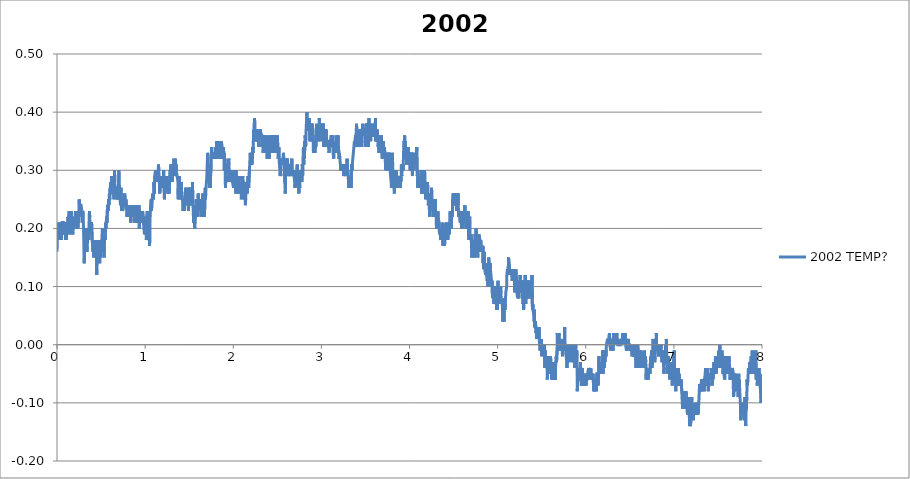
| Category | 2002 TEMP? |
|---|---|
| 0.0009014404444444445 | 0.16 |
| 0.003960782083333334 | 0.19 |
| 0.007023179472222222 | 0.19 |
| 0.010082798916666667 | 0.19 |
| 0.013142973944444445 | 0.19 |
| 0.01620231561111111 | 0.21 |
| 0.019261657249999998 | 0.2 |
| 0.0223215545 | 0.18 |
| 0.02538089613888889 | 0.19 |
| 0.028439959999999997 | 0.18 |
| 0.03149930166666667 | 0.19 |
| 0.034559754472222225 | 0.2 |
| 0.037619373916666664 | 0.21 |
| 0.04067871558333333 | 0.18 |
| 0.043738057222222224 | 0.2 |
| 0.04679739888888889 | 0.21 |
| 0.04985701833333333 | 0.18 |
| 0.05291635997222222 | 0.19 |
| 0.05597597941666666 | 0.2 |
| 0.059035598861111115 | 0.21 |
| 0.06209466272222222 | 0.21 |
| 0.06515567113888888 | 0.21 |
| 0.06821584616666666 | 0.21 |
| 0.07127518780555556 | 0.21 |
| 0.07433480725 | 0.19 |
| 0.07739414891666667 | 0.19 |
| 0.08045321277777778 | 0.21 |
| 0.08351311 | 0.19 |
| 0.0865721738611111 | 0.19 |
| 0.08963151552777779 | 0.21 |
| 0.09269085716666665 | 0.2 |
| 0.09575158777777777 | 0.2 |
| 0.09881092944444443 | 0.18 |
| 0.10187082666666668 | 0.2 |
| 0.10492989052777778 | 0.18 |
| 0.10798923219444444 | 0.19 |
| 0.11104829602777777 | 0.2 |
| 0.11410763769444444 | 0.19 |
| 0.11716697933333332 | 0.2 |
| 0.12022604319444445 | 0.21 |
| 0.12328566263888889 | 0.2 |
| 0.12634500430555556 | 0.22 |
| 0.12940406816666666 | 0.21 |
| 0.132463132 | 0.22 |
| 0.13552330705555557 | 0.22 |
| 0.1385829265 | 0.23 |
| 0.1416422681388889 | 0.19 |
| 0.14470188758333333 | 0.21 |
| 0.14776122922222223 | 0.23 |
| 0.1508205708888889 | 0.22 |
| 0.15388019033333333 | 0.23 |
| 0.15693925419444443 | 0.2 |
| 0.15999859583333334 | 0.23 |
| 0.1630579375 | 0.23 |
| 0.16611700133333332 | 0.2 |
| 0.169176343 | 0.19 |
| 0.1722356846388889 | 0.21 |
| 0.17529530408333333 | 0.21 |
| 0.17835520133333335 | 0.19 |
| 0.18141454297222223 | 0.2 |
| 0.18447360683333333 | 0.21 |
| 0.1875368376111111 | 0.2 |
| 0.1905967348333333 | 0.2 |
| 0.19365718766666667 | 0.2 |
| 0.1967176405 | 0.22 |
| 0.1997792045 | 0.22 |
| 0.20284049069444443 | 0.2 |
| 0.2059014991111111 | 0.22 |
| 0.20896084075000002 | 0.23 |
| 0.21202101580555555 | 0.23 |
| 0.21508202419444444 | 0.2 |
| 0.21814247702777778 | 0.22 |
| 0.22120209647222222 | 0.21 |
| 0.22426393827777777 | 0.22 |
| 0.2273235577222222 | 0.23 |
| 0.23038428833333333 | 0.2 |
| 0.2334444633611111 | 0.22 |
| 0.23650630516666665 | 0.2 |
| 0.2395675913611111 | 0.22 |
| 0.24262915536111113 | 0.23 |
| 0.24568877480555557 | 0.21 |
| 0.24874811647222222 | 0.23 |
| 0.2518074581111111 | 0.25 |
| 0.25486791094444444 | 0.24 |
| 0.2579280859722222 | 0.22 |
| 0.2609913167222222 | 0.24 |
| 0.2640520473611111 | 0.24 |
| 0.26711722266666665 | 0.24 |
| 0.2701776755 | 0.24 |
| 0.2732603518055556 | 0.24 |
| 0.2763194156666667 | 0.24 |
| 0.2793798685 | 0.24 |
| 0.2824392101388889 | 0.23 |
| 0.28549882958333334 | 0.22 |
| 0.28855817125 | 0.21 |
| 0.29161751288888893 | 0.23 |
| 0.29467685455555553 | 0.23 |
| 0.29773619619444447 | 0.22 |
| 0.30079553786111113 | 0.22 |
| 0.30385515730555557 | 0.18 |
| 0.30691449894444445 | 0.15 |
| 0.3099752295555555 | 0.14 |
| 0.313034849 | 0.18 |
| 0.31609419066666666 | 0.18 |
| 0.31915325452777776 | 0.18 |
| 0.32221315175 | 0.2 |
| 0.32527582694444446 | 0.18 |
| 0.3283354463888889 | 0.17 |
| 0.3313945102222222 | 0.19 |
| 0.3344538518888889 | 0.17 |
| 0.33751486030555555 | 0.17 |
| 0.34057447975000005 | 0.16 |
| 0.34363382138888887 | 0.17 |
| 0.3466942742222222 | 0.18 |
| 0.3497558382222222 | 0.2 |
| 0.3528149020833333 | 0.19 |
| 0.3558742437222222 | 0.19 |
| 0.3589335853888889 | 0.18 |
| 0.3619934826111111 | 0.2 |
| 0.3650531020555556 | 0.2 |
| 0.3681121659166666 | 0.23 |
| 0.3711720631666667 | 0.22 |
| 0.37423612730555555 | 0.21 |
| 0.37729519116666665 | 0.21 |
| 0.38035508838888893 | 0.21 |
| 0.3834147078333333 | 0.19 |
| 0.38647488286111115 | 0.21 |
| 0.38953478011111115 | 0.19 |
| 0.39259439955555553 | 0.21 |
| 0.39565374119444446 | 0.21 |
| 0.3987130828611111 | 0.18 |
| 0.4017721467222222 | 0.18 |
| 0.4048314883611111 | 0.17 |
| 0.40789110780555554 | 0.16 |
| 0.4109504494722222 | 0.18 |
| 0.4140103466944445 | 0.17 |
| 0.4170694105555555 | 0.15 |
| 0.42012875222222223 | 0.16 |
| 0.4231883716666667 | 0.17 |
| 0.42624771330555555 | 0.16 |
| 0.4293081661388889 | 0.17 |
| 0.43236778558333333 | 0.16 |
| 0.43542740502777777 | 0.17 |
| 0.43848730225 | 0.18 |
| 0.4415466439166667 | 0.17 |
| 0.4446059855555556 | 0.16 |
| 0.44766532722222224 | 0.15 |
| 0.4507246688611111 | 0.12 |
| 0.4537840105 | 0.15 |
| 0.4568433521666667 | 0.15 |
| 0.45990324941666666 | 0.16 |
| 0.46296231325000003 | 0.16 |
| 0.46602304388888893 | 0.17 |
| 0.46908544124999996 | 0.18 |
| 0.47214506069444445 | 0.17 |
| 0.4752069025 | 0.17 |
| 0.47826652194444447 | 0.16 |
| 0.48132641919444447 | 0.16 |
| 0.48438576083333335 | 0.14 |
| 0.4874503805555555 | 0.16 |
| 0.4905097222222222 | 0.18 |
| 0.49357323077777776 | 0.15 |
| 0.49663423919444444 | 0.17 |
| 0.4996944142222222 | 0.17 |
| 0.5027543114444445 | 0.16 |
| 0.5058358766111111 | 0.17 |
| 0.50889994075 | 0.17 |
| 0.5119620603333334 | 0.17 |
| 0.5150222353611111 | 0.2 |
| 0.518081577 | 0.19 |
| 0.5211445299722222 | 0.18 |
| 0.5242149833888889 | 0.19 |
| 0.5272784919444444 | 0.19 |
| 0.5303408893055556 | 0.17 |
| 0.53340050875 | 0.15 |
| 0.5364606838055556 | 0.17 |
| 0.5395200254444444 | 0.17 |
| 0.5425793670833333 | 0.19 |
| 0.5456384309444444 | 0.18 |
| 0.5486983281944444 | 0.19 |
| 0.5517590588055555 | 0.21 |
| 0.5548203450277778 | 0.2 |
| 0.5578799644722222 | 0.21 |
| 0.5609398616944444 | 0.21 |
| 0.56400337025 | 0.22 |
| 0.5670652120555556 | 0.21 |
| 0.5701248315 | 0.23 |
| 0.5731861176944445 | 0.23 |
| 0.5762535153611111 | 0.24 |
| 0.579318412888889 | 0.23 |
| 0.5823780323333334 | 0.23 |
| 0.5854382073611112 | 0.25 |
| 0.5884981046111111 | 0.24 |
| 0.5915630021388889 | 0.25 |
| 0.5946242883333334 | 0.26 |
| 0.5976839077777778 | 0.25 |
| 0.6007438050277777 | 0.25 |
| 0.6038053690277777 | 0.27 |
| 0.6068669330277777 | 0.26 |
| 0.6099287748055556 | 0.28 |
| 0.6129889498611111 | 0.28 |
| 0.6160510694444444 | 0.27 |
| 0.6191159669722222 | 0.29 |
| 0.6221755864166667 | 0.29 |
| 0.62523465025 | 0.28 |
| 0.6282978810277777 | 0.29 |
| 0.6313580560555556 | 0.29 |
| 0.6344176755 | 0.29 |
| 0.6374772949444445 | 0.28 |
| 0.6405388589444444 | 0.29 |
| 0.6435987561944445 | 0.26 |
| 0.6466630981111111 | 0.25 |
| 0.6497257733055556 | 0.27 |
| 0.652786226111111 | 0.3 |
| 0.6558483457222222 | 0.28 |
| 0.6589090763333334 | 0.27 |
| 0.6619686957777777 | 0.27 |
| 0.6650305375555556 | 0.27 |
| 0.6680926571666667 | 0.27 |
| 0.671153943361111 | 0.27 |
| 0.6742143961944443 | 0.26 |
| 0.6772748490277777 | 0.26 |
| 0.6803408577222222 | 0.27 |
| 0.6834035328888889 | 0.25 |
| 0.6864650968888889 | 0.27 |
| 0.6895272164722223 | 0.26 |
| 0.6925868359166667 | 0.25 |
| 0.69564728875 | 0.25 |
| 0.698708019361111 | 0.28 |
| 0.7017695833611111 | 0.3 |
| 0.7048294806111112 | 0.28 |
| 0.70788882225 | 0.28 |
| 0.7109506640555556 | 0.27 |
| 0.7140100056944444 | 0.27 |
| 0.7170693473611112 | 0.27 |
| 0.7201292445833334 | 0.24 |
| 0.7231891418333333 | 0.26 |
| 0.7262487612777777 | 0.27 |
| 0.7293081029166667 | 0.25 |
| 0.7323674445833334 | 0.23 |
| 0.735427619611111 | 0.24 |
| 0.7384872390555556 | 0.24 |
| 0.7415490808333334 | 0.25 |
| 0.7446092558888889 | 0.23 |
| 0.7476683197222223 | 0.23 |
| 0.7507276613888889 | 0.23 |
| 0.7537872808333334 | 0.24 |
| 0.7568477336666667 | 0.24 |
| 0.7599104088333334 | 0.25 |
| 0.7629725284166666 | 0.25 |
| 0.7660352035833333 | 0.25 |
| 0.7690948230277778 | 0.26 |
| 0.7721549980833333 | 0.25 |
| 0.77521767325 | 0.24 |
| 0.778278403861111 | 0.24 |
| 0.7813383011111111 | 0.25 |
| 0.7843979205555556 | 0.25 |
| 0.7874619846944444 | 0.24 |
| 0.7905229931111112 | 0.24 |
| 0.79358233475 | 0.22 |
| 0.796642232 | 0.22 |
| 0.7997015736388889 | 0.23 |
| 0.80276230425 | 0.23 |
| 0.8058224793055556 | 0.23 |
| 0.8088851544722223 | 0.24 |
| 0.8119500519999999 | 0.23 |
| 0.8150093936388888 | 0.23 |
| 0.8180726244166667 | 0.23 |
| 0.8211352995833334 | 0.23 |
| 0.8241960301944444 | 0.23 |
| 0.8272562052222222 | 0.22 |
| 0.8303169358611111 | 0.22 |
| 0.8333787776388889 | 0.23 |
| 0.8364389526666667 | 0.21 |
| 0.8395002388888889 | 0.24 |
| 0.8425623584722222 | 0.22 |
| 0.845629478361111 | 0.22 |
| 0.8486899311666667 | 0.22 |
| 0.8517506618055556 | 0.23 |
| 0.8548116701944445 | 0.23 |
| 0.8578721230277777 | 0.24 |
| 0.8609361871666668 | 0.22 |
| 0.8639971955833333 | 0.24 |
| 0.8670573706111111 | 0.22 |
| 0.8701172678611111 | 0.22 |
| 0.8731793874444445 | 0.23 |
| 0.8762426182222223 | 0.23 |
| 0.8793025154444445 | 0.21 |
| 0.8823621348888889 | 0.24 |
| 0.8854234211111112 | 0.23 |
| 0.8884847073055555 | 0.24 |
| 0.8915448823333333 | 0.23 |
| 0.8946086686944444 | 0.23 |
| 0.8976716216666667 | 0.22 |
| 0.9007323522777777 | 0.23 |
| 0.903792805111111 | 0.24 |
| 0.9068554802777777 | 0.23 |
| 0.9099159331111111 | 0.21 |
| 0.9129813862222221 | 0.21 |
| 0.9160410056666667 | 0.22 |
| 0.9191053475833333 | 0.21 |
| 0.9221644114444444 | 0.22 |
| 0.9252254198611112 | 0.21 |
| 0.9282875394444444 | 0.22 |
| 0.9313468811111111 | 0.24 |
| 0.93440622275 | 0.2 |
| 0.9374661200000001 | 0.2 |
| 0.9405329620833334 | 0.22 |
| 0.9435923037222222 | 0.21 |
| 0.9466519231666666 | 0.22 |
| 0.9497129315833334 | 0.21 |
| 0.9527725510277778 | 0.22 |
| 0.9558330038611111 | 0.21 |
| 0.9588931788888889 | 0.22 |
| 0.9619536317222223 | 0.21 |
| 0.9650154734999999 | 0.23 |
| 0.9680750929444445 | 0.21 |
| 0.971134434611111 | 0.23 |
| 0.9741976653611111 | 0.23 |
| 0.9772586737777778 | 0.22 |
| 0.9803205155555555 | 0.21 |
| 0.9833823573611111 | 0.21 |
| 0.9864422546111111 | 0.2 |
| 0.989503818611111 | 0.2 |
| 0.9925651048055555 | 0.19 |
| 0.9956258354166666 | 0.19 |
| 0.9986851770833333 | 0.19 |
| 1.0017445187222223 | 0.22 |
| 1.0048041381666666 | 0.22 |
| 1.0078690356944444 | 0.2 |
| 1.0109311552777778 | 0.19 |
| 1.013991608111111 | 0.18 |
| 1.0170551166666666 | 0.18 |
| 1.0201155695 | 0.19 |
| 1.0231749111388888 | 0.23 |
| 1.0262353639722221 | 0.2 |
| 1.0292988725277779 | 0.21 |
| 1.0323601587222222 | 0.21 |
| 1.0354211671388889 | 0.21 |
| 1.038480231 | 0.21 |
| 1.0415395726666667 | 0.22 |
| 1.0446022478333334 | 0.2 |
| 1.0476668675555556 | 0.19 |
| 1.0507292649444444 | 0.17 |
| 1.0537894399722223 | 0.21 |
| 1.0568543375000001 | 0.21 |
| 1.0599150681111111 | 0.23 |
| 1.062986354888889 | 0.24 |
| 1.066047918888889 | 0.24 |
| 1.0691089273055554 | 0.25 |
| 1.07216854675 | 0.23 |
| 1.07523011075 | 0.23 |
| 1.0782894524166666 | 0.25 |
| 1.0813526831666667 | 0.25 |
| 1.0844161917222221 | 0.25 |
| 1.08747636675 | 0.26 |
| 1.090536264 | 0.26 |
| 1.093597828 | 0.25 |
| 1.0966588364166667 | 0.26 |
| 1.0997215115833332 | 0.28 |
| 1.1027819644166665 | 0.28 |
| 1.1058454729722222 | 0.26 |
| 1.1089062035833332 | 0.29 |
| 1.111968045388889 | 0.29 |
| 1.1150346096666668 | 0.29 |
| 1.1180945068888888 | 0.3 |
| 1.12115357075 | 0.3 |
| 1.1242181905 | 0.29 |
| 1.127277532138889 | 0.29 |
| 1.1303385405555555 | 0.28 |
| 1.1334020491111112 | 0.29 |
| 1.13646139075 | 0.29 |
| 1.1395285106388888 | 0.29 |
| 1.1425897968333334 | 0.29 |
| 1.1456519164166667 | 0.29 |
| 1.148711535861111 | 0.3 |
| 1.1517733776666668 | 0.31 |
| 1.1548354972500001 | 0.3 |
| 1.1578948389166668 | 0.29 |
| 1.160954458361111 | 0.29 |
| 1.1640140778055554 | 0.27 |
| 1.1670767529722221 | 0.26 |
| 1.1701363724166665 | 0.29 |
| 1.1731987698055557 | 0.29 |
| 1.1762589448333334 | 0.28 |
| 1.1793213422222222 | 0.29 |
| 1.1823812394444444 | 0.27 |
| 1.1854436368333334 | 0.27 |
| 1.1885040896666668 | 0.27 |
| 1.1915650980555557 | 0.27 |
| 1.1946291622222223 | 0.29 |
| 1.197691004 | 0.28 |
| 1.2007536791666666 | 0.27 |
| 1.2038191322777778 | 0.29 |
| 1.2068795851111112 | 0.28 |
| 1.2099419825 | 0.3 |
| 1.2130027131111112 | 0.27 |
| 1.2160642771111112 | 0.27 |
| 1.2191252855277779 | 0.25 |
| 1.2221901830555557 | 0.27 |
| 1.2252498025 | 0.27 |
| 1.2283138666388889 | 0.28 |
| 1.2313765418055556 | 0.28 |
| 1.2344406059722224 | 0.29 |
| 1.2375168930277778 | 0.27 |
| 1.240577623638889 | 0.28 |
| 1.2436372430833333 | 0.28 |
| 1.2466979737222221 | 0.29 |
| 1.2497628712222222 | 0.28 |
| 1.2528236018611112 | 0.27 |
| 1.2559004445 | 0.28 |
| 1.2589622863055554 | 0.26 |
| 1.2620213501666666 | 0.26 |
| 1.265085969888889 | 0.26 |
| 1.2681458671388888 | 0.28 |
| 1.271207431138889 | 0.26 |
| 1.2742951077222222 | 0.27 |
| 1.2773569495277777 | 0.28 |
| 1.28041684675 | 0.28 |
| 1.283477577388889 | 0.3 |
| 1.2865380301944445 | 0.3 |
| 1.2895995942222223 | 0.28 |
| 1.292662824972222 | 0.31 |
| 1.2957221666111112 | 0.28 |
| 1.2987826194444445 | 0.28 |
| 1.3018480725555555 | 0.3 |
| 1.304907692 | 0.3 |
| 1.3079703671666667 | 0.28 |
| 1.3110294310277777 | 0.3 |
| 1.3140896060555556 | 0.3 |
| 1.3171525590277777 | 0.3 |
| 1.3202119006944446 | 0.29 |
| 1.3232717979166666 | 0.31 |
| 1.32633225075 | 0.32 |
| 1.3293927035833333 | 0.32 |
| 1.3324534341944445 | 0.3 |
| 1.3355133314444445 | 0.29 |
| 1.3385751732222222 | 0.29 |
| 1.3416347926666667 | 0.3 |
| 1.3446955233055558 | 0.32 |
| 1.3477779218055554 | 0.3 |
| 1.3508389302222223 | 0.31 |
| 1.3539027165833333 | 0.3 |
| 1.356967891888889 | 0.3 |
| 1.3600344561944444 | 0.3 |
| 1.3630943534166666 | 0.29 |
| 1.3661567508055554 | 0.29 |
| 1.3692172036388888 | 0.29 |
| 1.372277100861111 | 0.28 |
| 1.3753433873611112 | 0.25 |
| 1.3784038401944445 | 0.28 |
| 1.38146734875 | 0.27 |
| 1.3845283571666667 | 0.28 |
| 1.3875882543888889 | 0.29 |
| 1.3906481516388887 | 0.27 |
| 1.3937077710833334 | 0.28 |
| 1.3967710018333332 | 0.25 |
| 1.3998325658333333 | 0.25 |
| 1.4028927408611112 | 0.25 |
| 1.405954304861111 | 0.27 |
| 1.4090161466666666 | 0.28 |
| 1.4120765995 | 0.28 |
| 1.4151448305277778 | 0.26 |
| 1.4182041721944445 | 0.26 |
| 1.42127240325 | 0.26 |
| 1.4243361895833333 | 0.25 |
| 1.4273988647777778 | 0.24 |
| 1.4304607065555555 | 0.23 |
| 1.4335419939166667 | 0.24 |
| 1.436603280111111 | 0.25 |
| 1.4396681776388889 | 0.25 |
| 1.442727519277778 | 0.24 |
| 1.4457876943333334 | 0.23 |
| 1.4488484249444447 | 0.25 |
| 1.4519102667500001 | 0.25 |
| 1.4549712751388888 | 0.26 |
| 1.4580356170833335 | 0.26 |
| 1.4610980144722223 | 0.27 |
| 1.4641587450833335 | 0.24 |
| 1.4672205868888888 | 0.24 |
| 1.4702821508888888 | 0.26 |
| 1.4733417703333334 | 0.27 |
| 1.4764033343333334 | 0.26 |
| 1.479462953777778 | 0.25 |
| 1.4825234065833333 | 0.26 |
| 1.485584970611111 | 0.25 |
| 1.4886551461944444 | 0.24 |
| 1.491714765638889 | 0.23 |
| 1.494774662888889 | 0.25 |
| 1.4978348379166666 | 0.25 |
| 1.5008950129444445 | 0.24 |
| 1.5039549101944443 | 0.27 |
| 1.5070253635833335 | 0.25 |
| 1.5101135957777778 | 0.27 |
| 1.5131734930277778 | 0.26 |
| 1.5162328346666667 | 0.24 |
| 1.5192921763055556 | 0.25 |
| 1.5223548515 | 0.25 |
| 1.5254158599166665 | 0.24 |
| 1.5284779795 | 0.26 |
| 1.5315375989444444 | 0.25 |
| 1.5345972183888887 | 0.26 |
| 1.5376612825277778 | 0.28 |
| 1.5407220131388888 | 0.25 |
| 1.5437852439166666 | 0.24 |
| 1.5468451411388888 | 0.24 |
| 1.549905038388889 | 0.21 |
| 1.5529652134166667 | 0.22 |
| 1.5560270552222222 | 0.24 |
| 1.5590861190555556 | 0.22 |
| 1.5621460163055556 | 0.2 |
| 1.5652061913333333 | 0.2 |
| 1.5682691443055556 | 0.22 |
| 1.571330986111111 | 0.23 |
| 1.5743953280277778 | 0.24 |
| 1.5774546696944445 | 0.22 |
| 1.5805176226666668 | 0.25 |
| 1.5835786310833333 | 0.23 |
| 1.58664130625 | 0.24 |
| 1.5897014812777777 | 0.24 |
| 1.592761934111111 | 0.23 |
| 1.5958271094166667 | 0.22 |
| 1.5988897845833334 | 0.24 |
| 1.6019502374166668 | 0.26 |
| 1.6050126348055556 | 0.25 |
| 1.6080775323333334 | 0.25 |
| 1.6111452077777777 | 0.24 |
| 1.6142062161944444 | 0.24 |
| 1.6172655578611113 | 0.23 |
| 1.6203268440555556 | 0.23 |
| 1.6233867413055554 | 0.25 |
| 1.6264460829444445 | 0.25 |
| 1.6295065357777778 | 0.25 |
| 1.6325661552222221 | 0.23 |
| 1.6356304971666666 | 0.22 |
| 1.6386928945277777 | 0.22 |
| 1.6417594588333335 | 0.25 |
| 1.6448243563333333 | 0.23 |
| 1.6478839758055557 | 0.24 |
| 1.6509441508333333 | 0.24 |
| 1.6540037702777777 | 0.26 |
| 1.657065889861111 | 0.23 |
| 1.660135509861111 | 0.22 |
| 1.6631951293055556 | 0.23 |
| 1.6662608602222222 | 0.24 |
| 1.6693207574722222 | 0.22 |
| 1.6723814880833334 | 0.22 |
| 1.6754458300277777 | 0.22 |
| 1.67851044975 | 0.24 |
| 1.6815697913888887 | 0.27 |
| 1.6846302442222223 | 0.25 |
| 1.687689585888889 | 0.26 |
| 1.6907672619166667 | 0.26 |
| 1.6938313260555555 | 0.26 |
| 1.6968909455 | 0.26 |
| 1.699950009361111 | 0.29 |
| 1.7030107399722223 | 0.3 |
| 1.706070637222222 | 0.3 |
| 1.7091327568055554 | 0.33 |
| 1.7121926540277779 | 0.33 |
| 1.7152592183333333 | 0.32 |
| 1.7183199489444445 | 0.3 |
| 1.7213815129444445 | 0.31 |
| 1.7244430769444443 | 0.3 |
| 1.7275024185833334 | 0.29 |
| 1.7305617602499999 | 0.29 |
| 1.7336213796944444 | 0.27 |
| 1.7366859994166668 | 0.29 |
| 1.7397456188611111 | 0.27 |
| 1.7428063494722221 | 0.29 |
| 1.7458659689166667 | 0.29 |
| 1.7489272551388888 | 0.3 |
| 1.75198798575 | 0.33 |
| 1.755047883 | 0.34 |
| 1.7581091691944446 | 0.34 |
| 1.761168510861111 | 0.32 |
| 1.7642289636666666 | 0.32 |
| 1.7672888609166666 | 0.32 |
| 1.7703543140277778 | 0.33 |
| 1.7734136556666666 | 0.33 |
| 1.7764741085 | 0.32 |
| 1.7795367836666667 | 0.32 |
| 1.7825966809166667 | 0.32 |
| 1.7856621340277776 | 0.33 |
| 1.788732309638889 | 0.33 |
| 1.7917941514166666 | 0.32 |
| 1.7948587711666666 | 0.32 |
| 1.797921724138889 | 0.33 |
| 1.8009835659166666 | 0.34 |
| 1.804043185361111 | 0.32 |
| 1.8071036381944443 | 0.34 |
| 1.810167980138889 | 0.33 |
| 1.8132281551666667 | 0.35 |
| 1.8162922193055555 | 0.34 |
| 1.8193518387499998 | 0.34 |
| 1.8224142361388889 | 0.34 |
| 1.8254744111666665 | 0.32 |
| 1.8285354195833332 | 0.35 |
| 1.831596428 | 0.34 |
| 1.8346591031666668 | 0.35 |
| 1.8377203893611112 | 0.32 |
| 1.8407825089444443 | 0.33 |
| 1.843842128388889 | 0.32 |
| 1.8469100816666666 | 0.32 |
| 1.8499697011111111 | 0.32 |
| 1.8530320984722224 | 0.33 |
| 1.8560922735277778 | 0.34 |
| 1.85915217075 | 0.33 |
| 1.8622123457777777 | 0.33 |
| 1.8652747431666665 | 0.35 |
| 1.868336029361111 | 0.35 |
| 1.8714037048333332 | 0.34 |
| 1.87446471325 | 0.34 |
| 1.8775243326944444 | 0.32 |
| 1.8805842299166668 | 0.33 |
| 1.8836444049722223 | 0.32 |
| 1.886703746611111 | 0.33 |
| 1.8897650328055555 | 0.34 |
| 1.8928393753333332 | 0.32 |
| 1.8959012171111111 | 0.33 |
| 1.8989611143611111 | 0.3 |
| 1.9020224005555555 | 0.31 |
| 1.9050831311944443 | 0.32 |
| 1.9081455285555555 | 0.3 |
| 1.9112098704999998 | 0.27 |
| 1.914268934361111 | 0.27 |
| 1.9173382765833333 | 0.29 |
| 1.9203976182222222 | 0.28 |
| 1.9234569598888889 | 0.31 |
| 1.9265168571388889 | 0.3 |
| 1.9295770321666665 | 0.31 |
| 1.93263915175 | 0.3 |
| 1.9357034936944446 | 0.31 |
| 1.9387642243055554 | 0.31 |
| 1.9418246771388887 | 0.31 |
| 1.9448842965833335 | 0.3 |
| 1.9479461383611112 | 0.32 |
| 1.9510071467777779 | 0.31 |
| 1.9540695441666667 | 0.3 |
| 1.9571322193333334 | 0.29 |
| 1.9601932277499998 | 0.28 |
| 1.9632561807222222 | 0.29 |
| 1.9663158001666667 | 0.3 |
| 1.969375419611111 | 0.3 |
| 1.9724361502222223 | 0.3 |
| 1.9755060480277777 | 0.29 |
| 1.9785670564444444 | 0.28 |
| 1.981632787361111 | 0.28 |
| 1.984692129 | 0.28 |
| 1.987778138861111 | 0.3 |
| 1.9908410918055557 | 0.28 |
| 1.99390543375 | 0.28 |
| 1.996967831138889 | 0.28 |
| 2.0000391179166668 | 0.28 |
| 2.003100126333333 | 0.27 |
| 2.0061655794444446 | 0.28 |
| 2.0092260322777777 | 0.29 |
| 2.012285373916667 | 0.27 |
| 2.0153494380555554 | 0.28 |
| 2.0184121132222224 | 0.27 |
| 2.0214772885555554 | 0.3 |
| 2.024551353277778 | 0.27 |
| 2.027610694916667 | 0.26 |
| 2.0306705921666666 | 0.3 |
| 2.0337324339444445 | 0.29 |
| 2.036796498083333 | 0.29 |
| 2.0398583398888888 | 0.28 |
| 2.0429182371388888 | 0.27 |
| 2.0459778565833333 | 0.27 |
| 2.049037476027778 | 0.28 |
| 2.052096539861111 | 0.26 |
| 2.0551581038611113 | 0.29 |
| 2.058221612416667 | 0.28 |
| 2.0612845653888887 | 0.28 |
| 2.0643450182222223 | 0.28 |
| 2.0674046376666664 | 0.29 |
| 2.070464534916667 | 0.27 |
| 2.073526932277778 | 0.26 |
| 2.076586829527778 | 0.26 |
| 2.0796483935277776 | 0.28 |
| 2.082708012972222 | 0.27 |
| 2.0857687435833334 | 0.28 |
| 2.088830585388889 | 0.27 |
| 2.0918952051111113 | 0.25 |
| 2.0949556579444444 | 0.25 |
| 2.098015832972222 | 0.26 |
| 2.101076008 | 0.26 |
| 2.1041364608333333 | 0.28 |
| 2.107197747027778 | 0.29 |
| 2.1102618111666667 | 0.29 |
| 2.1133217084166667 | 0.27 |
| 2.116382439027778 | 0.28 |
| 2.1194476143611114 | 0.27 |
| 2.122510845111111 | 0.28 |
| 2.1255707423611114 | 0.26 |
| 2.128630639583333 | 0.25 |
| 2.1316910924166668 | 0.27 |
| 2.134754323194444 | 0.25 |
| 2.1378161649722225 | 0.24 |
| 2.140891340861111 | 0.25 |
| 2.143952904861111 | 0.26 |
| 2.1470136355 | 0.27 |
| 2.1500738105277777 | 0.28 |
| 2.1531362078888887 | 0.28 |
| 2.1561997164444446 | 0.27 |
| 2.159259058111111 | 0.26 |
| 2.1623211776944444 | 0.26 |
| 2.165380797138889 | 0.26 |
| 2.168440694388889 | 0.29 |
| 2.171500313833333 | 0.29 |
| 2.174566322527778 | 0.27 |
| 2.1776345535555555 | 0.27 |
| 2.180694173027778 | 0.27 |
| 2.1837543480555555 | 0.3 |
| 2.1868145230833336 | 0.31 |
| 2.189876364861111 | 0.32 |
| 2.1929357065277775 | 0.33 |
| 2.195994770388889 | 0.32 |
| 2.1990557788055556 | 0.31 |
| 2.202122065277778 | 0.32 |
| 2.205185851638889 | 0.31 |
| 2.2082549160555556 | 0.32 |
| 2.2113162022777777 | 0.31 |
| 2.2143777662777775 | 0.33 |
| 2.2174398858611113 | 0.32 |
| 2.220501449861111 | 0.34 |
| 2.2235610693055556 | 0.33 |
| 2.2266315226944444 | 0.34 |
| 2.2296936422777778 | 0.36 |
| 2.2327535395277778 | 0.37 |
| 2.2358131589722223 | 0.36 |
| 2.2388722228333333 | 0.38 |
| 2.2419321200555555 | 0.39 |
| 2.245003406861111 | 0.37 |
| 2.2480641374722223 | 0.37 |
| 2.2511262570555557 | 0.36 |
| 2.2541872654722224 | 0.35 |
| 2.2572485516666667 | 0.37 |
| 2.2603081711111113 | 0.37 |
| 2.2633711240833336 | 0.37 |
| 2.2664324103055553 | 0.35 |
| 2.2694920297500003 | 0.36 |
| 2.272554149333333 | 0.37 |
| 2.2756151577500003 | 0.35 |
| 2.2786772773333333 | 0.35 |
| 2.281743841611111 | 0.35 |
| 2.284804294444444 | 0.36 |
| 2.2878683585833333 | 0.35 |
| 2.2909993710000003 | 0.34 |
| 2.2940617683888886 | 0.35 |
| 2.2971222211944444 | 0.35 |
| 2.3001821184444444 | 0.36 |
| 2.3032453491944445 | 0.37 |
| 2.3063083021666664 | 0.36 |
| 2.309372366305556 | 0.37 |
| 2.3124325413611113 | 0.36 |
| 2.3154943831388892 | 0.36 |
| 2.318555113777778 | 0.36 |
| 2.3216177889444443 | 0.36 |
| 2.324679908527778 | 0.36 |
| 2.327741472527778 | 0.34 |
| 2.33080609225 | 0.34 |
| 2.3338696008055555 | 0.34 |
| 2.3369286646666665 | 0.36 |
| 2.3399896730833336 | 0.33 |
| 2.343052070472222 | 0.34 |
| 2.3461122455 | 0.35 |
| 2.349174642888889 | 0.35 |
| 2.3522350956944447 | 0.35 |
| 2.355294437361111 | 0.35 |
| 2.3583540568055557 | 0.36 |
| 2.3614150652222223 | 0.35 |
| 2.364474406861111 | 0.35 |
| 2.367534304111111 | 0.35 |
| 2.3705978126666665 | 0.35 |
| 2.373657432111111 | 0.34 |
| 2.376725385361111 | 0.36 |
| 2.3797897273055555 | 0.33 |
| 2.382854069222222 | 0.34 |
| 2.3859145220555558 | 0.32 |
| 2.3889744193055553 | 0.34 |
| 2.3920526509166664 | 0.35 |
| 2.3951256044444444 | 0.33 |
| 2.398185223888889 | 0.35 |
| 2.4012484546666664 | 0.33 |
| 2.4043114076388887 | 0.33 |
| 2.4073724160555554 | 0.32 |
| 2.410434535638889 | 0.34 |
| 2.4134972108055557 | 0.36 |
| 2.4165571080555557 | 0.35 |
| 2.4196172830833333 | 0.34 |
| 2.42268468075 | 0.33 |
| 2.425744022388889 | 0.35 |
| 2.428805030805556 | 0.35 |
| 2.4318643724722224 | 0.36 |
| 2.4349237141111115 | 0.35 |
| 2.4379858336944444 | 0.36 |
| 2.441080455138889 | 0.35 |
| 2.4441411857777777 | 0.34 |
| 2.4472069166666666 | 0.33 |
| 2.4502670916944442 | 0.33 |
| 2.4533328226111113 | 0.34 |
| 2.456394386611111 | 0.33 |
| 2.4594551172222223 | 0.34 |
| 2.4625164034444444 | 0.35 |
| 2.465579078611111 | 0.36 |
| 2.468639531444444 | 0.35 |
| 2.471699706472222 | 0.36 |
| 2.474760714888889 | 0.34 |
| 2.47781977875 | 0.33 |
| 2.4808824539166667 | 0.34 |
| 2.4839426289444444 | 0.34 |
| 2.4870030817777775 | 0.33 |
| 2.4900638123888887 | 0.34 |
| 2.493125376388889 | 0.33 |
| 2.496185829222222 | 0.34 |
| 2.499245170861111 | 0.33 |
| 2.502305068111111 | 0.36 |
| 2.5053696878333334 | 0.33 |
| 2.508434029777778 | 0.34 |
| 2.5114961493611108 | 0.32 |
| 2.514556324388889 | 0.33 |
| 2.5176176106111114 | 0.34 |
| 2.520678619 | 0.32 |
| 2.523744627722222 | 0.31 |
| 2.526805358333333 | 0.32 |
| 2.5298680335 | 0.3 |
| 2.532930430888889 | 0.29 |
| 2.535990883722222 | 0.3 |
| 2.5390516143333333 | 0.31 |
| 2.542113456138889 | 0.32 |
| 2.5451741867499997 | 0.32 |
| 2.548234917361111 | 0.32 |
| 2.5512987037222223 | 0.31 |
| 2.5543594343333336 | 0.31 |
| 2.557419331583333 | 0.31 |
| 2.5604795066111112 | 0.31 |
| 2.5635388482500003 | 0.32 |
| 2.5665987455 | 0.32 |
| 2.569661420666667 | 0.33 |
| 2.5727254848055554 | 0.33 |
| 2.5757853820555554 | 0.31 |
| 2.578853890888889 | 0.29 |
| 2.5819146215 | 0.3 |
| 2.5849761855000004 | 0.28 |
| 2.5880358049444445 | 0.28 |
| 2.59109598 | 0.26 |
| 2.5941561550277776 | 0.3 |
| 2.5972185523888887 | 0.31 |
| 2.600279838611111 | 0.32 |
| 2.6033402914444443 | 0.32 |
| 2.6064029666111113 | 0.3 |
| 2.6094628638333335 | 0.3 |
| 2.6125394286944443 | 0.32 |
| 2.61560765975 | 0.32 |
| 2.618672557277778 | 0.32 |
| 2.621734399083333 | 0.32 |
| 2.624794851888889 | 0.3 |
| 2.6278553047222224 | 0.29 |
| 2.6309143685833334 | 0.29 |
| 2.633975099194444 | 0.29 |
| 2.637034718638889 | 0.3 |
| 2.6400968382222225 | 0.29 |
| 2.6431631247222223 | 0.29 |
| 2.646222466388889 | 0.3 |
| 2.6492831970000004 | 0.31 |
| 2.6523430942222226 | 0.31 |
| 2.6554052138333333 | 0.3 |
| 2.6584648332777774 | 0.3 |
| 2.6615288974166664 | 0.3 |
| 2.664593794944444 | 0.32 |
| 2.6676536921666667 | 0.3 |
| 2.6707141450000003 | 0.3 |
| 2.673788765305556 | 0.29 |
| 2.676850884888889 | 0.29 |
| 2.6799163380000004 | 0.3 |
| 2.6829815133055557 | 0.3 |
| 2.6860422439444442 | 0.29 |
| 2.689103530138889 | 0.3 |
| 2.6921642607500003 | 0.29 |
| 2.695235825333333 | 0.28 |
| 2.698299333888889 | 0.29 |
| 2.7013633980277776 | 0.27 |
| 2.704428017777778 | 0.27 |
| 2.707487637222222 | 0.28 |
| 2.71054781225 | 0.29 |
| 2.71360937625 | 0.3 |
| 2.7166689956944445 | 0.28 |
| 2.719728615138889 | 0.29 |
| 2.7227890679444444 | 0.29 |
| 2.7258553544444446 | 0.31 |
| 2.728914696111111 | 0.28 |
| 2.7319745933333333 | 0.3 |
| 2.7350339349999997 | 0.3 |
| 2.7380938322222224 | 0.28 |
| 2.741154285055556 | 0.27 |
| 2.7442172380277774 | 0.26 |
| 2.7472790798055557 | 0.27 |
| 2.7503406438055555 | 0.3 |
| 2.753401374444444 | 0.27 |
| 2.7564634940277775 | 0.3 |
| 2.7595245024444446 | 0.3 |
| 2.7625855108611113 | 0.29 |
| 2.765645685888889 | 0.3 |
| 2.7687050275277776 | 0.3 |
| 2.7717663137499997 | 0.28 |
| 2.7748459343333334 | 0.29 |
| 2.7779058315555556 | 0.28 |
| 2.780974062611111 | 0.3 |
| 2.7840378489722224 | 0.31 |
| 2.7870974684166665 | 0.29 |
| 2.7901584768333336 | 0.31 |
| 2.7932214297777778 | 0.31 |
| 2.796280493638889 | 0.34 |
| 2.7993409464722223 | 0.31 |
| 2.8024011215 | 0.34 |
| 2.8054632410833333 | 0.33 |
| 2.808522860527778 | 0.32 |
| 2.81158886925 | 0.35 |
| 2.8146509888333333 | 0.34 |
| 2.817710608277778 | 0.36 |
| 2.820769672138889 | 0.34 |
| 2.8238304027499996 | 0.35 |
| 2.826890022194444 | 0.37 |
| 2.8299504750277777 | 0.37 |
| 2.8330095388611114 | 0.37 |
| 2.8360708250833335 | 0.4 |
| 2.839135722611111 | 0.37 |
| 2.842198953361111 | 0.38 |
| 2.8452602395833333 | 0.37 |
| 2.848325414888889 | 0.37 |
| 2.851385867722222 | 0.37 |
| 2.8544465983333334 | 0.37 |
| 2.8575064955833334 | 0.37 |
| 2.8605669483888887 | 0.37 |
| 2.8636287901944444 | 0.39 |
| 2.8666900763888887 | 0.36 |
| 2.8697502514444446 | 0.35 |
| 2.872819038083333 | 0.36 |
| 2.8758819910277778 | 0.37 |
| 2.8789416104722223 | 0.36 |
| 2.8820015077222223 | 0.37 |
| 2.885063905111111 | 0.35 |
| 2.8881243579166664 | 0.38 |
| 2.891183699583333 | 0.36 |
| 2.894243319027778 | 0.38 |
| 2.89730321625 | 0.38 |
| 2.900367002611111 | 0.38 |
| 2.903427455444444 | 0.37 |
| 2.906492352972222 | 0.36 |
| 2.9095572505 | 0.33 |
| 2.9126185366944446 | 0.35 |
| 2.915684545388889 | 0.35 |
| 2.9187447204166665 | 0.35 |
| 2.9218060066388887 | 0.34 |
| 2.924878404583333 | 0.34 |
| 2.9279380240277777 | 0.33 |
| 2.93100264375 | 0.35 |
| 2.934066430111111 | 0.35 |
| 2.937129105277778 | 0.34 |
| 2.9401884469444446 | 0.36 |
| 2.9432600115 | 0.37 |
| 2.946319353166667 | 0.38 |
| 2.949380361583333 | 0.37 |
| 2.9524397032222223 | 0.37 |
| 2.9555026561944446 | 0.36 |
| 2.958562553416667 | 0.37 |
| 2.9616235618333335 | 0.35 |
| 2.9646854036388888 | 0.36 |
| 2.967746689833333 | 0.37 |
| 2.9708079760555552 | 0.36 |
| 2.97388676325 | 0.37 |
| 2.976946104916667 | 0.39 |
| 2.9800079466944442 | 0.37 |
| 2.983067288361111 | 0.37 |
| 2.9861285745555555 | 0.37 |
| 2.9891901385555557 | 0.35 |
| 2.992253647111111 | 0.37 |
| 2.9953252116944444 | 0.38 |
| 2.9983867756944442 | 0.37 |
| 3.0014461173333333 | 0.36 |
| 3.0045057367777774 | 0.36 |
| 3.00756868975 | 0.36 |
| 3.01063025375 | 0.36 |
| 3.0136940401111114 | 0.38 |
| 3.0167550485277776 | 0.37 |
| 3.0198152235555558 | 0.36 |
| 3.022879843277778 | 0.38 |
| 3.0259400183055556 | 0.34 |
| 3.029002971277778 | 0.36 |
| 3.03206592425 | 0.37 |
| 3.0351272104444442 | 0.37 |
| 3.0381887744444445 | 0.35 |
| 3.041249505083333 | 0.36 |
| 3.044309957888889 | 0.36 |
| 3.0473773555555557 | 0.36 |
| 3.050436697222222 | 0.34 |
| 3.053500205777778 | 0.37 |
| 3.0565601030000003 | 0.36 |
| 3.05962000025 | 0.35 |
| 3.062684619972222 | 0.34 |
| 3.065747295166666 | 0.34 |
| 3.0688255267777778 | 0.35 |
| 3.071885146222222 | 0.35 |
| 3.0749455990555554 | 0.35 |
| 3.078007718638889 | 0.35 |
| 3.0810701160277776 | 0.35 |
| 3.084139736027778 | 0.34 |
| 3.087205744722222 | 0.33 |
| 3.0902656419722225 | 0.34 |
| 3.0933274837777778 | 0.34 |
| 3.096386825416667 | 0.34 |
| 3.0994458892777774 | 0.34 |
| 3.1025082866666667 | 0.35 |
| 3.105568739472222 | 0.35 |
| 3.108628358916667 | 0.34 |
| 3.1116882561666666 | 0.36 |
| 3.1147492645833337 | 0.34 |
| 3.117811106361111 | 0.34 |
| 3.1208704480277776 | 0.35 |
| 3.1239317342222224 | 0.36 |
| 3.126991631472222 | 0.35 |
| 3.130051528694444 | 0.35 |
| 3.1331122593333336 | 0.33 |
| 3.1361721565555554 | 0.33 |
| 3.1392342761388887 | 0.32 |
| 3.1422969513333334 | 0.35 |
| 3.1453626822222223 | 0.35 |
| 3.148424524027778 | 0.35 |
| 3.151497755361111 | 0.35 |
| 3.1545629306666667 | 0.34 |
| 3.1576308839444445 | 0.34 |
| 3.160690225583333 | 0.33 |
| 3.1637740130833336 | 0.34 |
| 3.1668372438333336 | 0.36 |
| 3.169897141083333 | 0.36 |
| 3.1729578716944444 | 0.36 |
| 3.1760172133333335 | 0.33 |
| 3.1790768327777776 | 0.35 |
| 3.1821386745833333 | 0.34 |
| 3.1852057944722225 | 0.33 |
| 3.188267080666667 | 0.36 |
| 3.1913344783333333 | 0.33 |
| 3.1943960423333335 | 0.34 |
| 3.197455383972222 | 0.33 |
| 3.200515559027778 | 0.32 |
| 3.203575178472222 | 0.33 |
| 3.2066342423055554 | 0.33 |
| 3.2096971952777777 | 0.32 |
| 3.212758759277778 | 0.32 |
| 3.215818378722222 | 0.31 |
| 3.2188788315555557 | 0.3 |
| 3.2219428956944447 | 0.31 |
| 3.225003348527778 | 0.3 |
| 3.2280660236944443 | 0.31 |
| 3.2311250875555557 | 0.31 |
| 3.234185540388889 | 0.31 |
| 3.237255716 | 0.31 |
| 3.2403172799999997 | 0.3 |
| 3.243377455027778 | 0.3 |
| 3.246440685777778 | 0.31 |
| 3.2495016941944446 | 0.3 |
| 3.2525646471666665 | 0.3 |
| 3.255624266611111 | 0.29 |
| 3.2586958311944443 | 0.29 |
| 3.261757672972222 | 0.29 |
| 3.2648167368333336 | 0.31 |
| 3.2678760784722223 | 0.31 |
| 3.270937642472222 | 0.3 |
| 3.2739972619166666 | 0.3 |
| 3.277059937111111 | 0.3 |
| 3.2801212233055552 | 0.29 |
| 3.2831819539166665 | 0.3 |
| 3.286241573388889 | 0.31 |
| 3.289308971055555 | 0.3 |
| 3.2923691460833333 | 0.32 |
| 3.295429321111111 | 0.29 |
| 3.298491162888889 | 0.3 |
| 3.3015543936666663 | 0.3 |
| 3.3046137353055554 | 0.29 |
| 3.307673076972222 | 0.28 |
| 3.310733807583333 | 0.27 |
| 3.313798705111111 | 0.28 |
| 3.3168586023333333 | 0.28 |
| 3.3199179439999997 | 0.28 |
| 3.322977007861111 | 0.28 |
| 3.3260394052500004 | 0.27 |
| 3.3291098586388888 | 0.28 |
| 3.332169200277778 | 0.29 |
| 3.335231875472222 | 0.28 |
| 3.338297050777778 | 0.27 |
| 3.3413594481666666 | 0.29 |
| 3.3444243456944442 | 0.31 |
| 3.3474920211388888 | 0.3 |
| 3.3505519183888888 | 0.31 |
| 3.353612093416667 | 0.31 |
| 3.3566719906666664 | 0.32 |
| 3.3597363325833336 | 0.32 |
| 3.362799007777778 | 0.33 |
| 3.3658600161666667 | 0.33 |
| 3.3689243581111112 | 0.34 |
| 3.371989255638889 | 0.34 |
| 3.375049152888889 | 0.35 |
| 3.3781087723333334 | 0.34 |
| 3.3811681139722225 | 0.35 |
| 3.3842310669444444 | 0.35 |
| 3.3872931865277778 | 0.36 |
| 3.39036725125 | 0.35 |
| 3.393427426277778 | 0.36 |
| 3.396500379805556 | 0.36 |
| 3.3995677774722224 | 0.38 |
| 3.4026307304444448 | 0.35 |
| 3.4056922944444445 | 0.35 |
| 3.4087602477222223 | 0.35 |
| 3.4118193115555555 | 0.34 |
| 3.4148819867499998 | 0.34 |
| 3.4179504955833333 | 0.35 |
| 3.4210109484166664 | 0.36 |
| 3.4240714012222226 | 0.36 |
| 3.427130742888889 | 0.36 |
| 3.4301923068888893 | 0.36 |
| 3.4332530374999997 | 0.37 |
| 3.4363165460555556 | 0.36 |
| 3.439379499027778 | 0.35 |
| 3.4424457855277777 | 0.34 |
| 3.445505404972222 | 0.36 |
| 3.448566413388889 | 0.37 |
| 3.4516268661944443 | 0.35 |
| 3.4546892635833335 | 0.34 |
| 3.4577488830277776 | 0.36 |
| 3.460808502472222 | 0.36 |
| 3.4638789558611114 | 0.36 |
| 3.466939130916667 | 0.36 |
| 3.470000417111111 | 0.38 |
| 3.4730617033333333 | 0.36 |
| 3.4761246562777774 | 0.37 |
| 3.479186498083333 | 0.37 |
| 3.4822466731111112 | 0.37 |
| 3.4853060147777777 | 0.37 |
| 3.4883664675833335 | 0.37 |
| 3.4914277538055556 | 0.37 |
| 3.4944870954444442 | 0.36 |
| 3.497547548277778 | 0.34 |
| 3.5006093900555557 | 0.36 |
| 3.5036690095 | 0.37 |
| 3.5067294623333334 | 0.37 |
| 3.5097996379444445 | 0.38 |
| 3.512859257388889 | 0.35 |
| 3.5159194324166667 | 0.38 |
| 3.5189812742222224 | 0.37 |
| 3.5220420048333336 | 0.38 |
| 3.525105513388889 | 0.37 |
| 3.528168466361111 | 0.34 |
| 3.5312344750555558 | 0.35 |
| 3.534298539194445 | 0.34 |
| 3.537359269805555 | 0.36 |
| 3.5404200004444446 | 0.39 |
| 3.543486009138889 | 0.37 |
| 3.546553962388889 | 0.37 |
| 3.5496135818333334 | 0.38 |
| 3.552677923777778 | 0.37 |
| 3.555741154527778 | 0.37 |
| 3.558801607361111 | 0.35 |
| 3.5618617823888887 | 0.36 |
| 3.564922513 | 0.37 |
| 3.56798241025 | 0.36 |
| 3.571042585277778 | 0.36 |
| 3.574104149277778 | 0.38 |
| 3.577169602388889 | 0.36 |
| 3.580229221833333 | 0.36 |
| 3.5832885635 | 0.36 |
| 3.5863490163055554 | 0.36 |
| 3.5894153028055555 | 0.36 |
| 3.5924782557777775 | 0.37 |
| 3.5955384308055556 | 0.37 |
| 3.598603606138889 | 0.37 |
| 3.6016635033611113 | 0.37 |
| 3.6047275675000003 | 0.37 |
| 3.6077899648888887 | 0.38 |
| 3.6108526400555556 | 0.37 |
| 3.6139142040555554 | 0.39 |
| 3.6169735457222223 | 0.35 |
| 3.620033998555556 | 0.36 |
| 3.62310000725 | 0.36 |
| 3.6261607378611114 | 0.36 |
| 3.6292211906944445 | 0.35 |
| 3.6322810879166667 | 0.37 |
| 3.635340429583333 | 0.37 |
| 3.63840310475 | 0.36 |
| 3.641469669027778 | 0.35 |
| 3.644529566277778 | 0.34 |
| 3.6475897413055556 | 0.34 |
| 3.6506513053055554 | 0.35 |
| 3.653711758138889 | 0.33 |
| 3.656771377583333 | 0.33 |
| 3.6598340527500004 | 0.33 |
| 3.662893394416667 | 0.36 |
| 3.665953013861111 | 0.36 |
| 3.669021244888889 | 0.34 |
| 3.6720825311111107 | 0.35 |
| 3.6751457618611107 | 0.34 |
| 3.678210659388889 | 0.36 |
| 3.6812755569166664 | 0.36 |
| 3.6843368431111108 | 0.36 |
| 3.6873964625555558 | 0.34 |
| 3.6904580265555555 | 0.32 |
| 3.6935220907222224 | 0.34 |
| 3.696581710166667 | 0.35 |
| 3.699641607388889 | 0.34 |
| 3.7027015046388887 | 0.35 |
| 3.7057636242222225 | 0.34 |
| 3.7088232436666666 | 0.33 |
| 3.711882863111111 | 0.33 |
| 3.714943038138889 | 0.34 |
| 3.7180051577222226 | 0.34 |
| 3.721067832916667 | 0.34 |
| 3.7241293969166667 | 0.32 |
| 3.7271951278055555 | 0.31 |
| 3.730255580638889 | 0.3 |
| 3.7333149222777777 | 0.3 |
| 3.7363773196666665 | 0.3 |
| 3.7394399948333334 | 0.3 |
| 3.7424993365 | 0.33 |
| 3.745558678138889 | 0.33 |
| 3.7486227422777776 | 0.3 |
| 3.7516837506944447 | 0.31 |
| 3.7547436479444443 | 0.32 |
| 3.7578146569166666 | 0.3 |
| 3.7608739985833335 | 0.33 |
| 3.763936118166667 | 0.32 |
| 3.7669954598055555 | 0.31 |
| 3.770057579388889 | 0.33 |
| 3.773121087944445 | 0.33 |
| 3.7761809851944443 | 0.31 |
| 3.7792406046388893 | 0.31 |
| 3.7823080023055557 | 0.31 |
| 3.7853706774722222 | 0.29 |
| 3.7884308525277777 | 0.29 |
| 3.7915015836944446 | 0.28 |
| 3.794564258888889 | 0.27 |
| 3.797624156111111 | 0.28 |
| 3.8006923871666665 | 0.3 |
| 3.8037525621944446 | 0.33 |
| 3.80681607075 | 0.32 |
| 3.8098754124166665 | 0.31 |
| 3.8129366986111113 | 0.29 |
| 3.815997151444445 | 0.3 |
| 3.819057882055555 | 0.28 |
| 3.8221175015 | 0.28 |
| 3.825178787722222 | 0.28 |
| 3.828259519472222 | 0.26 |
| 3.8313224724444446 | 0.27 |
| 3.8343818140833337 | 0.27 |
| 3.837442266916667 | 0.28 |
| 3.8405038309166666 | 0.3 |
| 3.8435640059444443 | 0.29 |
| 3.8466247365833333 | 0.28 |
| 3.849684078222222 | 0.29 |
| 3.8527453644166663 | 0.3 |
| 3.8558049838611113 | 0.28 |
| 3.8588643255277777 | 0.28 |
| 3.861925611722222 | 0.27 |
| 3.864986620138889 | 0.27 |
| 3.8680459618055556 | 0.27 |
| 3.871108636972222 | 0.28 |
| 3.874167978611111 | 0.28 |
| 3.8772284314444443 | 0.28 |
| 3.88029027325 | 0.29 |
| 3.883356004138889 | 0.28 |
| 3.8864172903611114 | 0.28 |
| 3.8894802433333333 | 0.27 |
| 3.8925393071666665 | 0.28 |
| 3.895600315583333 | 0.27 |
| 3.8986674354722224 | 0.29 |
| 3.9017273326944446 | 0.28 |
| 3.9047886189166667 | 0.29 |
| 3.907849905111111 | 0.31 |
| 3.9109092467777775 | 0.29 |
| 3.9139685884166666 | 0.3 |
| 3.917036263888889 | 0.31 |
| 3.9200967166944443 | 0.3 |
| 3.923162447611111 | 0.31 |
| 3.92622651175 | 0.3 |
| 3.9292900203055554 | 0.31 |
| 3.9323507509166666 | 0.33 |
| 3.9354120371388888 | 0.34 |
| 3.938479157 | 0.35 |
| 3.9415482214444446 | 0.34 |
| 3.944609229861111 | 0.36 |
| 3.9476685715 | 0.36 |
| 3.9507315244722223 | 0.33 |
| 3.953792532888889 | 0.35 |
| 3.956856319222222 | 0.33 |
| 3.9599301061666665 | 0.32 |
| 3.9629894478055556 | 0.33 |
| 3.966051011805556 | 0.31 |
| 3.969111464638889 | 0.31 |
| 3.9721730286388888 | 0.34 |
| 3.9752326480833333 | 0.34 |
| 3.978292823111111 | 0.34 |
| 3.981352998138889 | 0.33 |
| 3.984413450972222 | 0.34 |
| 3.9874725148333336 | 0.33 |
| 3.990534634416667 | 0.33 |
| 3.993597587388889 | 0.33 |
| 3.996660540361111 | 0.31 |
| 3.9997196041944445 | 0.31 |
| 4.002781168194444 | 0.33 |
| 4.005847454694444 | 0.33 |
| 4.008909852083334 | 0.3 |
| 4.011969193722222 | 0.33 |
| 4.0150288131666665 | 0.31 |
| 4.018090377166667 | 0.32 |
| 4.021158330444444 | 0.3 |
| 4.0242179498888895 | 0.33 |
| 4.027279236083333 | 0.32 |
| 4.0303385777222225 | 0.3 |
| 4.033402364083333 | 0.29 |
| 4.036462261333333 | 0.32 |
| 4.039527158833334 | 0.33 |
| 4.0425948343055556 | 0.33 |
| 4.0456561205 | 0.31 |
| 4.048716851138889 | 0.3 |
| 4.051778137333334 | 0.31 |
| 4.054837479 | 0.32 |
| 4.057896820638889 | 0.31 |
| 4.060960607 | 0.32 |
| 4.064023559972222 | 0.33 |
| 4.067088457472222 | 0.32 |
| 4.070154466194444 | 0.31 |
| 4.073227141916667 | 0.32 |
| 4.076286761388889 | 0.31 |
| 4.079346380833333 | 0.31 |
| 4.082406833638888 | 0.34 |
| 4.085467008666667 | 0.3 |
| 4.088531350611111 | 0.29 |
| 4.091592359027778 | 0.3 |
| 4.094651700666667 | 0.27 |
| 4.097711042333333 | 0.27 |
| 4.100775939861111 | 0.27 |
| 4.103835003722223 | 0.29 |
| 4.106895456527778 | 0.28 |
| 4.109954798194444 | 0.27 |
| 4.113016639972222 | 0.27 |
| 4.116075703833333 | 0.28 |
| 4.119135323277778 | 0.28 |
| 4.1221966095 | 0.29 |
| 4.125257062305556 | 0.27 |
| 4.128316681749999 | 0.27 |
| 4.131376301194445 | 0.3 |
| 4.1344423099166665 | 0.29 |
| 4.1375047072777775 | 0.26 |
| 4.140565437916667 | 0.27 |
| 4.143626446305555 | 0.26 |
| 4.146686621361111 | 0.27 |
| 4.149746240805555 | 0.27 |
| 4.152806971416667 | 0.27 |
| 4.155866313055555 | 0.28 |
| 4.158928432638889 | 0.28 |
| 4.161989996666667 | 0.29 |
| 4.165056005361111 | 0.28 |
| 4.168115902583334 | 0.28 |
| 4.171176355416667 | 0.3 |
| 4.174239863972222 | 0.28 |
| 4.177299205611111 | 0.28 |
| 4.1803588250555554 | 0.26 |
| 4.183417888916667 | 0.25 |
| 4.1864786195555554 | 0.25 |
| 4.189538516777778 | 0.26 |
| 4.192598969611112 | 0.27 |
| 4.195661367 | 0.26 |
| 4.198720708638889 | 0.27 |
| 4.201780328083333 | 0.27 |
| 4.204840503111111 | 0.28 |
| 4.207900400361111 | 0.26 |
| 4.210962519944444 | 0.26 |
| 4.214026306305556 | 0.24 |
| 4.217087314694444 | 0.26 |
| 4.220146934138889 | 0.25 |
| 4.223211831666667 | 0.24 |
| 4.226275895805555 | 0.24 |
| 4.2293391265833336 | 0.22 |
| 4.232399023805556 | 0.22 |
| 4.235458365472223 | 0.24 |
| 4.238518262722223 | 0.25 |
| 4.241582882444444 | 0.23 |
| 4.244642779666667 | 0.23 |
| 4.247701843527778 | 0.25 |
| 4.250763963111111 | 0.27 |
| 4.253826916083333 | 0.24 |
| 4.256887091111111 | 0.24 |
| 4.259958100111111 | 0.23 |
| 4.263019108527778 | 0.23 |
| 4.26608372825 | 0.25 |
| 4.269147792388889 | 0.22 |
| 4.272207689638889 | 0.23 |
| 4.2752720315833335 | 0.23 |
| 4.278332762194444 | 0.24 |
| 4.2814073825 | 0.24 |
| 4.284469224277778 | 0.23 |
| 4.287529121527777 | 0.23 |
| 4.290597630361112 | 0.22 |
| 4.293659749944444 | 0.25 |
| 4.296724647472222 | 0.22 |
| 4.2997864892777775 | 0.23 |
| 4.302851664583334 | 0.22 |
| 4.305911561833333 | 0.2 |
| 4.308971736861111 | 0.2 |
| 4.312035523222223 | 0.22 |
| 4.315096809416667 | 0.22 |
| 4.31815726225 | 0.21 |
| 4.321217715055555 | 0.23 |
| 4.3242784456944445 | 0.22 |
| 4.327339731888889 | 0.22 |
| 4.330407129555556 | 0.22 |
| 4.333467026805556 | 0.22 |
| 4.336526368444445 | 0.21 |
| 4.339587376861111 | 0.19 |
| 4.342654218944444 | 0.19 |
| 4.3457146717777775 | 0.2 |
| 4.3487770691388885 | 0.19 |
| 4.351843355638889 | 0.19 |
| 4.354902697305556 | 0.18 |
| 4.357962872333333 | 0.19 |
| 4.361025825305555 | 0.2 |
| 4.364092945166666 | 0.18 |
| 4.367152286833334 | 0.19 |
| 4.370218573305555 | 0.21 |
| 4.373279303944444 | 0.19 |
| 4.376340034555556 | 0.19 |
| 4.379408821194445 | 0.17 |
| 4.382476496638889 | 0.19 |
| 4.385536116083333 | 0.18 |
| 4.3885987912777775 | 0.18 |
| 4.391660355277778 | 0.19 |
| 4.394723030444444 | 0.18 |
| 4.397782372083333 | 0.17 |
| 4.400843936083334 | 0.18 |
| 4.403905222305555 | 0.2 |
| 4.406965397333334 | 0.2 |
| 4.410025850166667 | 0.2 |
| 4.413085191805556 | 0.21 |
| 4.41614481125 | 0.18 |
| 4.419204986277777 | 0.19 |
| 4.422264050138889 | 0.19 |
| 4.425323947388889 | 0.2 |
| 4.428390233888889 | 0.21 |
| 4.431457631555555 | 0.19 |
| 4.4345169731944445 | 0.18 |
| 4.437582426305555 | 0.19 |
| 4.440642601333334 | 0.19 |
| 4.4437038875555555 | 0.19 |
| 4.446772396388889 | 0.2 |
| 4.449846183305556 | 0.2 |
| 4.452910803027778 | 0.19 |
| 4.455971533666667 | 0.21 |
| 4.459030875305555 | 0.21 |
| 4.462092994888889 | 0.23 |
| 4.465152892138889 | 0.21 |
| 4.468215845111112 | 0.21 |
| 4.471277686888889 | 0.22 |
| 4.474344528972222 | 0.2 |
| 4.4774041484166665 | 0.22 |
| 4.480465434638889 | 0.23 |
| 4.483527276416667 | 0.22 |
| 4.48658772925 | 0.23 |
| 4.4896476265 | 0.25 |
| 4.492707523722222 | 0.24 |
| 4.495767143166667 | 0.26 |
| 4.4988325962777775 | 0.25 |
| 4.501893326888889 | 0.25 |
| 4.504956835444444 | 0.24 |
| 4.508016454888889 | 0.24 |
| 4.511075796555556 | 0.26 |
| 4.514140971861111 | 0.25 |
| 4.5172005913055555 | 0.24 |
| 4.52026021075 | 0.25 |
| 4.52332177475 | 0.24 |
| 4.526384727722222 | 0.24 |
| 4.529446013944445 | 0.26 |
| 4.532507855722222 | 0.24 |
| 4.535569975305555 | 0.23 |
| 4.53863431725 | 0.25 |
| 4.541697548027778 | 0.26 |
| 4.54475744525 | 0.26 |
| 4.5478173425 | 0.25 |
| 4.550879739861111 | 0.26 |
| 4.553939359305555 | 0.24 |
| 4.55699897875 | 0.22 |
| 4.560059709388889 | 0.23 |
| 4.563123773527777 | 0.23 |
| 4.566184781944444 | 0.22 |
| 4.569244679166667 | 0.23 |
| 4.572304298611111 | 0.22 |
| 4.575363918055555 | 0.21 |
| 4.578424370888889 | 0.23 |
| 4.581483712555556 | 0.23 |
| 4.584544165361112 | 0.22 |
| 4.587604062611111 | 0.22 |
| 4.590667015583334 | 0.2 |
| 4.593728579583334 | 0.21 |
| 4.596788754611111 | 0.2 |
| 4.599850318611112 | 0.21 |
| 4.602911882611111 | 0.21 |
| 4.605979558083333 | 0.22 |
| 4.609046122361112 | 0.23 |
| 4.612109353111111 | 0.22 |
| 4.6151717505 | 0.23 |
| 4.618232758916666 | 0.22 |
| 4.621292378361111 | 0.22 |
| 4.624358664861111 | 0.21 |
| 4.6274213400277775 | 0.24 |
| 4.630484292999999 | 0.24 |
| 4.6335447458333325 | 0.24 |
| 4.636604365277778 | 0.21 |
| 4.639665095888889 | 0.2 |
| 4.6427258265 | 0.21 |
| 4.645786001527777 | 0.21 |
| 4.648845620972223 | 0.21 |
| 4.651904962638889 | 0.21 |
| 4.654964304277778 | 0.22 |
| 4.658024201527778 | 0.21 |
| 4.6610885434444445 | 0.21 |
| 4.664165663888889 | 0.22 |
| 4.667227505694444 | 0.23 |
| 4.670292681027778 | 0.19 |
| 4.673354522805555 | 0.18 |
| 4.676415253416667 | 0.18 |
| 4.679474595083334 | 0.18 |
| 4.6825375480555556 | 0.22 |
| 4.685598000861112 | 0.21 |
| 4.688660953833334 | 0.18 |
| 4.691720295500001 | 0.19 |
| 4.6947815816944445 | 0.18 |
| 4.697841756722223 | 0.19 |
| 4.70090193175 | 0.18 |
| 4.703962106805555 | 0.17 |
| 4.70702172625 | 0.15 |
| 4.710084401416666 | 0.16 |
| 4.713144298666667 | 0.17 |
| 4.7162041958888885 | 0.16 |
| 4.719266037694444 | 0.16 |
| 4.722326212722222 | 0.17 |
| 4.725399444055555 | 0.18 |
| 4.728461008055556 | 0.17 |
| 4.731520627499999 | 0.18 |
| 4.734582747083333 | 0.16 |
| 4.7376426443333335 | 0.15 |
| 4.740702541555556 | 0.17 |
| 4.743781328777779 | 0.19 |
| 4.746840948222222 | 0.18 |
| 4.749903901194445 | 0.19 |
| 4.752963520638889 | 0.18 |
| 4.756023417861111 | 0.2 |
| 4.759084981861111 | 0.19 |
| 4.7621471014444445 | 0.18 |
| 4.765206720888889 | 0.19 |
| 4.7682674515277785 | 0.18 |
| 4.771328182138888 | 0.18 |
| 4.774395301999999 | 0.15 |
| 4.7774557548333325 | 0.17 |
| 4.780519541194444 | 0.17 |
| 4.783579160638889 | 0.17 |
| 4.78663989125 | 0.19 |
| 4.789710066861112 | 0.19 |
| 4.792769964083333 | 0.19 |
| 4.7958295835277776 | 0.19 |
| 4.798891147527778 | 0.18 |
| 4.801951878166666 | 0.16 |
| 4.805011775388889 | 0.17 |
| 4.808074450583334 | 0.18 |
| 4.8111335144166665 | 0.18 |
| 4.814199800916667 | 0.18 |
| 4.81726025375 | 0.16 |
| 4.820322095527778 | 0.16 |
| 4.823381992777778 | 0.16 |
| 4.826454390722223 | 0.17 |
| 4.8295176215 | 0.16 |
| 4.832583630194444 | 0.17 |
| 4.835648249916667 | 0.14 |
| 4.838710925111111 | 0.16 |
| 4.841777489388889 | 0.13 |
| 4.844840720138889 | 0.15 |
| 4.847901728555556 | 0.16 |
| 4.850961347999999 | 0.16 |
| 4.85402124525 | 0.13 |
| 4.857081975861112 | 0.13 |
| 4.8601515958888895 | 0.13 |
| 4.8632109375277786 | 0.12 |
| 4.866271668138889 | 0.13 |
| 4.869334343333334 | 0.14 |
| 4.872396185111111 | 0.13 |
| 4.875460527055556 | 0.12 |
| 4.878522368861111 | 0.14 |
| 4.881583655055556 | 0.11 |
| 4.884646330222222 | 0.13 |
| 4.8877112277500006 | 0.13 |
| 4.890773347333334 | 0.1 |
| 4.893832966777778 | 0.11 |
| 4.896895364166666 | 0.12 |
| 4.899955539194444 | 0.15 |
| 4.9030151586388895 | 0.13 |
| 4.9060745003055555 | 0.12 |
| 4.909137453277778 | 0.13 |
| 4.912234297055555 | 0.11 |
| 4.915293638722223 | 0.14 |
| 4.918354647138888 | 0.13 |
| 4.921417600083333 | 0.13 |
| 4.92447694175 | 0.13 |
| 4.927537950166666 | 0.13 |
| 4.93060006975 | 0.11 |
| 4.933661355944444 | 0.1 |
| 4.936723475527778 | 0.11 |
| 4.939783094972222 | 0.09 |
| 4.942842158833334 | 0.08 |
| 4.9459034450555555 | 0.08 |
| 4.948963342277779 | 0.08 |
| 4.952033795694445 | 0.09 |
| 4.9550942485 | 0.08 |
| 4.958153867944445 | 0.07 |
| 4.9612132096111115 | 0.08 |
| 4.964272829055555 | 0.07 |
| 4.967333559666667 | 0.08 |
| 4.970394845888889 | 0.08 |
| 4.973455020916667 | 0.1 |
| 4.976514362555556 | 0.07 |
| 4.979575648777778 | 0.08 |
| 4.982638879527778 | 0.08 |
| 4.9856998879444445 | 0.07 |
| 4.988760618555555 | 0.06 |
| 4.991820515805555 | 0.08 |
| 4.99488902463889 | 0.06 |
| 4.997951422027778 | 0.07 |
| 5.001012986027778 | 0.09 |
| 5.004075105611111 | 0.11 |
| 5.007145836805555 | 0.09 |
| 5.010211567694444 | 0.08 |
| 5.0132734095 | 0.1 |
| 5.016332751138889 | 0.07 |
| 5.019392092805556 | 0.09 |
| 5.022455045777778 | 0.1 |
| 5.0255196655 | 0.09 |
| 5.028579284944445 | 0.08 |
| 5.031640848944445 | 0.09 |
| 5.034706302055555 | 0.1 |
| 5.037766477083333 | 0.09 |
| 5.040825818749999 | 0.08 |
| 5.043885160388888 | 0.08 |
| 5.046948668944444 | 0.08 |
| 5.050008010611111 | 0.08 |
| 5.053072352527778 | 0.07 |
| 5.056132805361111 | 0.07 |
| 5.059193258194445 | 0.04 |
| 5.062253988805556 | 0.04 |
| 5.0653152750277775 | 0.06 |
| 5.068377394611111 | 0.07 |
| 5.07143673625 | 0.04 |
| 5.074496077916667 | 0.07 |
| 5.077555975138889 | 0.08 |
| 5.080615594583334 | 0.08 |
| 5.083677991972222 | 0.06 |
| 5.086739555972223 | 0.07 |
| 5.089808342611112 | 0.08 |
| 5.092869351027777 | 0.09 |
| 5.095931192805556 | 0.09 |
| 5.098994979166667 | 0.09 |
| 5.102058209916667 | 0.1 |
| 5.105118107166667 | 0.12 |
| 5.108184115861111 | 0.12 |
| 5.111244846472222 | 0.13 |
| 5.1143050215 | 0.13 |
| 5.1173663077222225 | 0.13 |
| 5.120429538472222 | 0.12 |
| 5.123489991305556 | 0.15 |
| 5.126550166333333 | 0.15 |
| 5.129610619166667 | 0.15 |
| 5.13267357213889 | 0.15 |
| 5.135732913777778 | 0.13 |
| 5.1387994780833335 | 0.13 |
| 5.141859375305556 | 0.12 |
| 5.144923439444445 | 0.12 |
| 5.147986392416667 | 0.13 |
| 5.151046289666667 | 0.13 |
| 5.154105909111111 | 0.12 |
| 5.157165528555556 | 0.12 |
| 5.16022681475 | 0.13 |
| 5.1632867120000006 | 0.13 |
| 5.166347442611111 | 0.11 |
| 5.169409284416667 | 0.12 |
| 5.172468626055556 | 0.13 |
| 5.175527689916667 | 0.12 |
| 5.178587864944444 | 0.12 |
| 5.181649428944445 | 0.11 |
| 5.184709603972223 | 0.13 |
| 5.187769223416667 | 0.12 |
| 5.190828287277777 | 0.11 |
| 5.193887906722223 | 0.09 |
| 5.196947803972222 | 0.11 |
| 5.200007145611111 | 0.12 |
| 5.203071765333333 | 0.12 |
| 5.206131940388889 | 0.13 |
| 5.209191004222221 | 0.13 |
| 5.212253957194444 | 0.12 |
| 5.21531413225 | 0.11 |
| 5.218374307277777 | 0.09 |
| 5.221437538027778 | 0.09 |
| 5.224496879694444 | 0.09 |
| 5.227556776916667 | 0.08 |
| 5.230620563277778 | 0.08 |
| 5.23368351625 | 0.09 |
| 5.236746469194444 | 0.08 |
| 5.239808311 | 0.1 |
| 5.2428679304444445 | 0.11 |
| 5.245930327833333 | 0.09 |
| 5.248998558888888 | 0.1 |
| 5.2520592895 | 0.1 |
| 5.255122242472223 | 0.12 |
| 5.258192418055556 | 0.11 |
| 5.261251759722222 | 0.1 |
| 5.264311379166666 | 0.11 |
| 5.2673782212499995 | 0.11 |
| 5.2704406186111115 | 0.09 |
| 5.2735057939444445 | 0.09 |
| 5.276568469111111 | 0.11 |
| 5.279627810777777 | 0.08 |
| 5.282687430222222 | 0.11 |
| 5.2857484386388895 | 0.08 |
| 5.288807780277779 | 0.07 |
| 5.291871566638888 | 0.08 |
| 5.294931463861111 | 0.06 |
| 5.297991638888889 | 0.08 |
| 5.301059869944444 | 0.07 |
| 5.3041283787777775 | 0.07 |
| 5.307189942777778 | 0.11 |
| 5.310254006944445 | 0.09 |
| 5.313318904444444 | 0.12 |
| 5.316379357277778 | 0.09 |
| 5.319441199083333 | 0.07 |
| 5.322501651888889 | 0.07 |
| 5.325564327083334 | 0.11 |
| 5.328623668722222 | 0.09 |
| 5.3316868995 | 0.11 |
| 5.334752352611111 | 0.1 |
| 5.337814472194445 | 0.11 |
| 5.3408765917777785 | 0.09 |
| 5.343938711361112 | 0.08 |
| 5.347007498 | 0.08 |
| 5.350069617583333 | 0.11 |
| 5.35312895925 | 0.08 |
| 5.356189967638889 | 0.08 |
| 5.359250698277778 | 0.08 |
| 5.362311706694444 | 0.11 |
| 5.365373548472222 | 0.09 |
| 5.368433167916667 | 0.09 |
| 5.371493065166667 | 0.1 |
| 5.3745537957777785 | 0.1 |
| 5.377613415222222 | 0.08 |
| 5.380673312472222 | 0.08 |
| 5.383735709833333 | 0.09 |
| 5.386795329277778 | 0.08 |
| 5.389857171083333 | 0.12 |
| 5.392917901694444 | 0.07 |
| 5.395979465694444 | 0.06 |
| 5.399042140888889 | 0.07 |
| 5.402101482527778 | 0.06 |
| 5.405160824166667 | 0.06 |
| 5.40823711125 | 0.06 |
| 5.411297286277778 | 0.05 |
| 5.4143716287777774 | 0.04 |
| 5.417432081611111 | 0.06 |
| 5.42049142325 | 0.03 |
| 5.423550487111111 | 0.04 |
| 5.426611495527778 | 0.03 |
| 5.429671670555556 | 0.04 |
| 5.432733234555555 | 0.03 |
| 5.435793687388888 | 0.02 |
| 5.438853584638889 | 0.03 |
| 5.441913204083333 | 0.03 |
| 5.444976434833333 | 0.01 |
| 5.448035498694444 | 0.02 |
| 5.451094840333333 | 0.02 |
| 5.454160015666666 | 0.03 |
| 5.457227413333333 | 0.02 |
| 5.460290644083333 | 0.03 |
| 5.4633549860277775 | 0.02 |
| 5.4664148832777775 | 0.01 |
| 5.469476725055556 | 0.03 |
| 5.472536622305555 | 0.01 |
| 5.4755976307222225 | 0 |
| 5.478665306166667 | 0 |
| 5.481725759 | -0.01 |
| 5.484791212111111 | -0.01 |
| 5.487851942722222 | -0.01 |
| 5.490911562166667 | 0 |
| 5.493971459416667 | 0.01 |
| 5.497032467833334 | -0.01 |
| 5.50009347625 | -0.02 |
| 5.503155318027778 | 0 |
| 5.506214381888889 | -0.01 |
| 5.509274556916667 | -0.01 |
| 5.5123372320833335 | 0 |
| 5.515396295944444 | 0 |
| 5.5184611934722225 | 0 |
| 5.521526091 | 0 |
| 5.524587377222222 | -0.01 |
| 5.527650607972222 | -0.02 |
| 5.530711338583334 | 0 |
| 5.533771235833333 | 0 |
| 5.536831966444445 | -0.04 |
| 5.539904086611112 | -0.02 |
| 5.542964817222222 | -0.01 |
| 5.546030270333333 | -0.03 |
| 5.549091834333334 | -0.04 |
| 5.552151453777777 | -0.03 |
| 5.555213573361111 | -0.03 |
| 5.558285137944444 | -0.02 |
| 5.561345868555556 | -0.04 |
| 5.564414933 | -0.06 |
| 5.567476774777778 | -0.02 |
| 5.570536672027777 | -0.02 |
| 5.573596847055556 | -0.03 |
| 5.576655910916667 | -0.02 |
| 5.579721364027777 | -0.02 |
| 5.5827815390555555 | -0.04 |
| 5.5858411585 | -0.04 |
| 5.588901889111111 | -0.03 |
| 5.591962341944444 | -0.02 |
| 5.595022239194445 | -0.02 |
| 5.598083525388889 | -0.03 |
| 5.6011442559999995 | -0.02 |
| 5.60420415325 | -0.05 |
| 5.607267939611111 | -0.03 |
| 5.610330336972222 | -0.04 |
| 5.613391067611111 | -0.06 |
| 5.61645040925 | -0.05 |
| 5.61951197325 | -0.04 |
| 5.622571592694444 | -0.05 |
| 5.6256334345 | -0.06 |
| 5.628693053944445 | -0.06 |
| 5.631752395583333 | -0.04 |
| 5.634815348555556 | -0.03 |
| 5.637874968 | -0.06 |
| 5.640935976416666 | -0.05 |
| 5.644000318361111 | -0.06 |
| 5.64706132675 | -0.05 |
| 5.650120668416666 | -0.03 |
| 5.653180010055555 | -0.06 |
| 5.6562415740555565 | -0.05 |
| 5.659301749111112 | -0.03 |
| 5.662363035305555 | -0.03 |
| 5.665425154888888 | -0.02 |
| 5.668485329916667 | -0.03 |
| 5.671544671583333 | -0.03 |
| 5.6746054021944445 | -0.01 |
| 5.677665021638889 | 0.02 |
| 5.680724641083333 | 0 |
| 5.6837856495 | 0 |
| 5.686847769083333 | 0 |
| 5.689916000138889 | 0 |
| 5.692975619583334 | 0 |
| 5.696036350194444 | 0.02 |
| 5.699095969638889 | -0.01 |
| 5.702155866888889 | 0.01 |
| 5.705216875305555 | 0 |
| 5.708280661638889 | 0.01 |
| 5.711345836972222 | 0 |
| 5.714422401805555 | 0 |
| 5.71748202125 | 0 |
| 5.720544418638889 | 0 |
| 5.723607927194444 | 0 |
| 5.726668102222222 | 0 |
| 5.729728832861111 | 0 |
| 5.732792063611111 | -0.01 |
| 5.735851960861112 | -0.02 |
| 5.738917136166667 | 0 |
| 5.741977311194445 | 0 |
| 5.745036652861112 | 0 |
| 5.748101550388889 | 0 |
| 5.751162003194445 | 0.01 |
| 5.754221622638889 | 0.01 |
| 5.757281242083333 | 0 |
| 5.760342528305556 | 0.03 |
| 5.763416593027777 | 0 |
| 5.766477045833333 | -0.01 |
| 5.7695394432222225 | 0 |
| 5.77260045163889 | 0 |
| 5.775659793277778 | 0 |
| 5.778720801694444 | -0.02 |
| 5.781781810111111 | -0.02 |
| 5.78484115175 | -0.03 |
| 5.7879038269444445 | -0.04 |
| 5.790980669583333 | -0.01 |
| 5.79404001125 | -0.02 |
| 5.797099075111111 | -0.01 |
| 5.800159527916667 | 0 |
| 5.80321998075 | -0.02 |
| 5.806285156055555 | -0.03 |
| 5.809346164472222 | -0.01 |
| 5.812407172888888 | -0.01 |
| 5.815469570277777 | 0 |
| 5.818533634416666 | -0.01 |
| 5.8215968651944445 | 0 |
| 5.824660929333334 | 0 |
| 5.827720826555556 | -0.02 |
| 5.830788779805555 | -0.01 |
| 5.833850066027778 | 0 |
| 5.836910796638889 | -0.01 |
| 5.8399731940277775 | -0.03 |
| 5.843036146999999 | -0.03 |
| 5.846101044527778 | -0.01 |
| 5.849160663972222 | -0.01 |
| 5.852219727805555 | -0.02 |
| 5.855280180638888 | 0 |
| 5.8583417446388895 | -0.01 |
| 5.861403586444444 | -0.01 |
| 5.864463761472222 | -0.01 |
| 5.867525881055555 | -0.01 |
| 5.870588278444444 | -0.01 |
| 5.8736509536111114 | -0.04 |
| 5.876710017472223 | -0.03 |
| 5.8797701925000005 | -0.03 |
| 5.882830367527777 | -0.02 |
| 5.885890542555555 | 0 |
| 5.88895071761111 | -0.04 |
| 5.8920147817499995 | -0.04 |
| 5.895074956777778 | -0.02 |
| 5.898138465333334 | -0.01 |
| 5.901199751527778 | -0.02 |
| 5.904259093194445 | -0.08 |
| 5.907318990416667 | -0.06 |
| 5.9103780542777775 | -0.06 |
| 5.913437951527778 | -0.04 |
| 5.916498126555555 | -0.06 |
| 5.919558857166667 | -0.06 |
| 5.92262097675 | -0.06 |
| 5.925681707388889 | -0.06 |
| 5.928749105055555 | -0.06 |
| 5.931808446694444 | -0.05 |
| 5.9348700106944445 | -0.05 |
| 5.9379293523611105 | -0.05 |
| 5.941008972944444 | -0.03 |
| 5.944068592388889 | -0.06 |
| 5.947134323277778 | -0.06 |
| 5.9501944983333335 | -0.07 |
| 5.953263840555556 | -0.05 |
| 5.956326237916667 | -0.07 |
| 5.95939308 | -0.04 |
| 5.9624526994444444 | -0.06 |
| 5.96551204111111 | -0.07 |
| 5.968572771722222 | -0.07 |
| 5.971637113666667 | -0.05 |
| 5.974697288694444 | -0.07 |
| 5.977756352555556 | -0.06 |
| 5.980818194333333 | -0.07 |
| 5.983877258194444 | -0.07 |
| 5.9869391 | -0.07 |
| 5.989998997222222 | -0.05 |
| 5.993059450055555 | -0.07 |
| 5.996118791722223 | -0.06 |
| 5.999179244527778 | -0.06 |
| 6.002241086333333 | -0.07 |
| 6.005300705777778 | -0.07 |
| 6.008367825638889 | -0.07 |
| 6.0114277228888895 | -0.06 |
| 6.014488175722223 | -0.06 |
| 6.017551962055555 | -0.06 |
| 6.020612970472222 | -0.05 |
| 6.023677312416667 | -0.05 |
| 6.026738043027778 | -0.05 |
| 6.02980266275 | -0.05 |
| 6.032863393388888 | -0.04 |
| 6.035923568416667 | -0.04 |
| 6.038982910055555 | -0.04 |
| 6.0420514189166665 | -0.05 |
| 6.045117427611111 | -0.06 |
| 6.048178158222223 | -0.05 |
| 6.051239166638888 | -0.05 |
| 6.054298508277777 | -0.05 |
| 6.057358405527778 | -0.04 |
| 6.060423303055556 | -0.04 |
| 6.06348458925 | -0.06 |
| 6.066548375611111 | -0.06 |
| 6.069609106222222 | -0.06 |
| 6.0726687256666665 | -0.05 |
| 6.075732512027778 | -0.06 |
| 6.07879240925 | -0.06 |
| 6.0818523065 | -0.05 |
| 6.084914703888889 | -0.06 |
| 6.087974323333333 | -0.06 |
| 6.091036442916667 | -0.08 |
| 6.094097451333334 | -0.07 |
| 6.097159293111111 | -0.07 |
| 6.100220023722223 | -0.08 |
| 6.103280476555556 | -0.08 |
| 6.106342596138889 | -0.08 |
| 6.109404993527778 | -0.06 |
| 6.112465446361111 | -0.06 |
| 6.115528399333333 | -0.06 |
| 6.118591907888889 | -0.06 |
| 6.121651805111111 | -0.08 |
| 6.124714480305555 | -0.05 |
| 6.1277749331111115 | -0.05 |
| 6.130836219333333 | -0.05 |
| 6.133898338916667 | -0.05 |
| 6.136959069527777 | -0.05 |
| 6.140022855888889 | -0.07 |
| 6.143083030916666 | -0.06 |
| 6.146142650361112 | -0.05 |
| 6.149204492166667 | -0.02 |
| 6.152263833805556 | -0.05 |
| 6.155323731055556 | -0.05 |
| 6.158385572833333 | -0.05 |
| 6.161445470083334 | -0.04 |
| 6.164505089527777 | -0.05 |
| 6.167573598361111 | -0.05 |
| 6.170633217805555 | -0.04 |
| 6.17369283725 | -0.03 |
| 6.1767527345 | -0.04 |
| 6.179812909527778 | -0.05 |
| 6.182873084555555 | -0.05 |
| 6.185932704 | -0.04 |
| 6.1889934346111115 | -0.05 |
| 6.192058887722222 | -0.01 |
| 6.195124063055556 | -0.05 |
| 6.1981836825 | -0.03 |
| 6.201246635472223 | -0.04 |
| 6.204305977111112 | -0.01 |
| 6.207365040972221 | -0.03 |
| 6.210424660416667 | -0.04 |
| 6.213493447055556 | -0.02 |
| 6.216553344277777 | -0.03 |
| 6.219612963722223 | -0.03 |
| 6.222672860972222 | -0.03 |
| 6.225734424972223 | -0.01 |
| 6.228800155888889 | -0.02 |
| 6.231866720166667 | -0.01 |
| 6.234929117555555 | 0 |
| 6.237988459194444 | 0 |
| 6.241049189805556 | 0 |
| 6.2441085314722224 | 0 |
| 6.247168150916666 | 0.01 |
| 6.250227492555555 | 0 |
| 6.253288500972222 | 0.01 |
| 6.256348120416667 | 0 |
| 6.259411351194445 | 0.01 |
| 6.2624712484166665 | 0.01 |
| 6.2655347569722215 | 0.01 |
| 6.268594654222222 | 0.02 |
| 6.271661774083333 | 0 |
| 6.274721671333333 | 0 |
| 6.2777957360277785 | 0 |
| 6.280855355472222 | 0 |
| 6.283920808611112 | -0.01 |
| 6.286980150250001 | 0 |
| 6.2900419920555555 | 0.01 |
| 6.2931016115 | 0 |
| 6.2961631755 | 0.01 |
| 6.299225295083334 | 0 |
| 6.302289637 | 0 |
| 6.305348978666666 | 0.01 |
| 6.308408320305555 | -0.01 |
| 6.311469050944445 | 0 |
| 6.3145325595 | 0.02 |
| 6.317594679083333 | 0 |
| 6.320654298527778 | 0.01 |
| 6.323713917972222 | 0 |
| 6.326779093277778 | 0 |
| 6.3298389905277785 | 0.01 |
| 6.332899998944444 | 0 |
| 6.335962951916667 | 0 |
| 6.3390250715 | 0.01 |
| 6.342085524305555 | 0.02 |
| 6.345150699638889 | 0.01 |
| 6.348219486277778 | 0 |
| 6.351280494694444 | 0.02 |
| 6.354340391916667 | 0.01 |
| 6.3574025115 | 0 |
| 6.360463797722222 | 0.01 |
| 6.363524250555555 | 0 |
| 6.36658387 | 0 |
| 6.369644045027777 | 0 |
| 6.3727067201944445 | 0 |
| 6.375766061833334 | 0 |
| 6.378830959361111 | 0 |
| 6.381890578805556 | 0.01 |
| 6.384950198249999 | 0 |
| 6.388009817694445 | 0 |
| 6.39107332625 | 0 |
| 6.394133779083333 | 0 |
| 6.397196176472223 | 0 |
| 6.400261074 | 0 |
| 6.4033209712222225 | 0.01 |
| 6.406385313166666 | 0.01 |
| 6.409446877166666 | 0 |
| 6.412508441166667 | 0.01 |
| 6.415574727666667 | 0 |
| 6.418634624888889 | 0.02 |
| 6.421695355527778 | 0.02 |
| 6.424754419388889 | 0.01 |
| 6.4278154277777775 | 0.01 |
| 6.430879491944444 | 0.02 |
| 6.4339393891666665 | 0.01 |
| 6.437003453305556 | 0.02 |
| 6.440064183944444 | 0.01 |
| 6.443124358972222 | 0 |
| 6.446183978416667 | 0.02 |
| 6.449243597861111 | 0.01 |
| 6.452302661722222 | 0 |
| 6.455362281166667 | 0 |
| 6.458424956333333 | 0 |
| 6.461484575777778 | -0.01 |
| 6.4645441952222225 | 0.01 |
| 6.467604925833333 | 0 |
| 6.470668989972221 | 0 |
| 6.473745554833333 | 0 |
| 6.47680656325 | -0.01 |
| 6.479865904916667 | 0 |
| 6.482929413472222 | 0.01 |
| 6.485990699666666 | 0 |
| 6.489050596916667 | 0 |
| 6.492111605305556 | 0 |
| 6.495170946972222 | 0 |
| 6.498232788777777 | 0 |
| 6.501294074972222 | 0 |
| 6.504357027944444 | 0 |
| 6.507416647388889 | -0.01 |
| 6.510480989333334 | -0.01 |
| 6.513540608777777 | 0 |
| 6.516602450555555 | 0 |
| 6.519669570444444 | -0.01 |
| 6.5227291898888895 | -0.01 |
| 6.525789087111111 | -0.02 |
| 6.528849262138889 | -0.02 |
| 6.531908326000001 | -0.01 |
| 6.534971001194444 | -0.01 |
| 6.538031731805556 | -0.01 |
| 6.541109963416667 | -0.02 |
| 6.544170694027778 | -0.02 |
| 6.547235869361112 | -0.02 |
| 6.5502960443888885 | 0 |
| 6.553356775 | -0.02 |
| 6.556416394444445 | -0.01 |
| 6.55947823625 | -0.01 |
| 6.562538133472222 | -0.02 |
| 6.565597475138889 | -0.01 |
| 6.568657372388889 | -0.01 |
| 6.571716991833333 | -0.04 |
| 6.574777722444445 | -0.02 |
| 6.577838730861111 | -0.02 |
| 6.580900850444444 | -0.03 |
| 6.583962414444445 | -0.02 |
| 6.587026200777778 | -0.02 |
| 6.5900972097777775 | 0 |
| 6.593157662611111 | 0 |
| 6.596220615555556 | -0.02 |
| 6.5992846797222215 | -0.02 |
| 6.602346243722223 | -0.03 |
| 6.605406140944444 | -0.02 |
| 6.6084668715833335 | -0.04 |
| 6.611526213222223 | -0.02 |
| 6.614585554861112 | -0.01 |
| 6.617649896805555 | -0.02 |
| 6.620712294194444 | -0.03 |
| 6.623774691583334 | -0.02 |
| 6.626837644527778 | -0.01 |
| 6.6298989307500005 | -0.01 |
| 6.632958272388889 | -0.02 |
| 6.636017891833333 | -0.04 |
| 6.639078344666666 | -0.02 |
| 6.642162132166667 | -0.03 |
| 6.6452228627777785 | -0.02 |
| 6.648282760027778 | -0.02 |
| 6.65134737975 | -0.03 |
| 6.654409221555556 | -0.02 |
| 6.657469118777778 | -0.04 |
| 6.6605320717500005 | -0.03 |
| 6.6635955803055555 | -0.02 |
| 6.666659366666667 | -0.01 |
| 6.669719541694445 | -0.03 |
| 6.672779716722222 | -0.03 |
| 6.675839336166667 | -0.02 |
| 6.6788995111944445 | -0.02 |
| 6.681960797416666 | -0.03 |
| 6.685020694638889 | -0.06 |
| 6.688081147472222 | -0.05 |
| 6.691140766916666 | -0.04 |
| 6.694203164305556 | -0.04 |
| 6.6972727843055555 | -0.04 |
| 6.700336570666666 | -0.05 |
| 6.7033967456944445 | -0.05 |
| 6.7064566429444445 | -0.05 |
| 6.709515984583334 | -0.06 |
| 6.712579770944445 | -0.06 |
| 6.715639112583333 | -0.04 |
| 6.718700954388889 | -0.05 |
| 6.721761962777778 | -0.04 |
| 6.724821304444444 | -0.04 |
| 6.7278812016666665 | -0.05 |
| 6.730942487888889 | -0.05 |
| 6.734004051888889 | -0.03 |
| 6.737067282638889 | -0.02 |
| 6.740126902083333 | -0.03 |
| 6.743186799333333 | -0.02 |
| 6.746248085527778 | -0.01 |
| 6.749308260583334 | -0.02 |
| 6.752367880027777 | -0.04 |
| 6.755436111055555 | -0.02 |
| 6.758502953138889 | -0.01 |
| 6.761566461694445 | 0 |
| 6.764626081138888 | 0.01 |
| 6.76769153425 | 0 |
| 6.770750875916667 | 0 |
| 6.7738129955 | 0 |
| 6.776884560055556 | 0 |
| 6.77994723525 | 0 |
| 6.783007132472222 | -0.03 |
| 6.786069529861111 | -0.02 |
| 6.789129149305555 | -0.01 |
| 6.792208769888888 | -0.01 |
| 6.795273389638889 | 0 |
| 6.798333009083333 | 0 |
| 6.801393461888888 | 0.02 |
| 6.8044541925277775 | -0.01 |
| 6.807513811972222 | 0 |
| 6.810573431416667 | 0 |
| 6.813632773055556 | -0.01 |
| 6.8166940592500005 | 0 |
| 6.819753678694444 | 0 |
| 6.822818576222223 | 0 |
| 6.825877917888889 | -0.02 |
| 6.828939204083333 | -0.01 |
| 6.831999101333333 | -0.01 |
| 6.835060665333334 | -0.01 |
| 6.838125840638889 | -0.01 |
| 6.841192404944445 | 0 |
| 6.844253968944444 | 0 |
| 6.847313310583333 | -0.01 |
| 6.8503723744444445 | -0.01 |
| 6.8534406055 | 0 |
| 6.8564999471388886 | -0.02 |
| 6.8595603999722226 | -0.01 |
| 6.86262140838889 | -0.01 |
| 6.865681305611111 | -0.03 |
| 6.868743703 | -0.02 |
| 6.8718061003888895 | -0.02 |
| 6.874866831 | -0.02 |
| 6.87792672825 | -0.01 |
| 6.88098829225 | -0.02 |
| 6.884051800805555 | -0.04 |
| 6.887111698027778 | -0.05 |
| 6.890171039694445 | -0.04 |
| 6.893230381333333 | -0.03 |
| 6.896292778722222 | -0.02 |
| 6.899353231527777 | -0.01 |
| 6.902414795527778 | -0.02 |
| 6.905476637333334 | 0 |
| 6.908536256777778 | -0.02 |
| 6.9115961540277775 | -0.01 |
| 6.914657162444445 | 0.01 |
| 6.91772233775 | -0.01 |
| 6.920781401611111 | -0.03 |
| 6.923853521777778 | -0.02 |
| 6.926923975166667 | -0.04 |
| 6.929991372833333 | -0.05 |
| 6.933050436694445 | -0.04 |
| 6.936109778333333 | -0.02 |
| 6.939169675583334 | -0.03 |
| 6.9422659637777775 | -0.03 |
| 6.945331972472222 | -0.05 |
| 6.948391869722222 | -0.05 |
| 6.951452322555555 | -0.03 |
| 6.954511386416667 | -0.06 |
| 6.957570728055556 | -0.05 |
| 6.960638125722222 | -0.03 |
| 6.963715246166666 | -0.05 |
| 6.966776810166667 | -0.04 |
| 6.969843374444444 | -0.04 |
| 6.972903271694444 | -0.04 |
| 6.975965669083333 | -0.03 |
| 6.979042233944445 | -0.05 |
| 6.982243250361111 | -0.07 |
| 6.985309259055556 | -0.04 |
| 6.988371100861111 | -0.05 |
| 6.991432109250001 | -0.04 |
| 6.99449117311111 | -0.03 |
| 6.997550514777778 | -0.05 |
| 7.000611523194444 | -0.02 |
| 7.003671976 | -0.01 |
| 7.006732984416667 | -0.04 |
| 7.009792326083333 | -0.04 |
| 7.0128566679999995 | -0.06 |
| 7.015917398638889 | -0.04 |
| 7.018980073805556 | -0.06 |
| 7.022040248833334 | -0.08 |
| 7.025100146083333 | -0.04 |
| 7.028173377416667 | -0.06 |
| 7.031236052583334 | -0.07 |
| 7.034295672027778 | -0.07 |
| 7.037358069416666 | -0.06 |
| 7.0404185222499995 | -0.07 |
| 7.043478419472223 | -0.06 |
| 7.046543039194444 | -0.06 |
| 7.04960654775 | -0.04 |
| 7.052667556166667 | -0.05 |
| 7.05573912075 | -0.07 |
| 7.058807351805555 | -0.06 |
| 7.061867249027778 | -0.05 |
| 7.064930757583333 | -0.06 |
| 7.067991488222222 | -0.07 |
| 7.071056107944444 | -0.07 |
| 7.074127950305556 | -0.06 |
| 7.0771881253333335 | -0.06 |
| 7.080249133750001 | -0.07 |
| 7.083308753194444 | -0.06 |
| 7.086368928222223 | -0.06 |
| 7.08942910325 | -0.08 |
| 7.092490111666667 | -0.08 |
| 7.095563343 | -0.1 |
| 7.098623518027778 | -0.11 |
| 7.101685637638889 | -0.08 |
| 7.104744979277778 | -0.08 |
| 7.107806265472222 | -0.09 |
| 7.110865607138889 | -0.09 |
| 7.113927448916667 | -0.09 |
| 7.116987346166666 | -0.08 |
| 7.120048354583333 | -0.09 |
| 7.123109363 | -0.09 |
| 7.126168982444444 | -0.11 |
| 7.129230824222223 | -0.1 |
| 7.132290165888889 | -0.11 |
| 7.135352007666667 | -0.09 |
| 7.138412182722223 | -0.08 |
| 7.141475969055556 | -0.09 |
| 7.144535866305556 | -0.09 |
| 7.147601597194445 | -0.11 |
| 7.150664827972222 | -0.1 |
| 7.153723891833334 | -0.12 |
| 7.1567851780277785 | -0.11 |
| 7.159846186444444 | -0.1 |
| 7.162906083666667 | -0.09 |
| 7.165969036638889 | -0.1 |
| 7.169031156222222 | -0.09 |
| 7.172094664805555 | -0.09 |
| 7.175155395416667 | -0.12 |
| 7.178214737055556 | -0.14 |
| 7.18127741225 | -0.13 |
| 7.184338420638889 | -0.11 |
| 7.187398317888889 | -0.14 |
| 7.190457937333333 | -0.14 |
| 7.193519223527778 | -0.13 |
| 7.19658050975 | -0.12 |
| 7.199640129194444 | -0.12 |
| 7.202701693194444 | -0.09 |
| 7.2057615904166665 | -0.12 |
| 7.208836488527778 | -0.12 |
| 7.211898330333334 | -0.12 |
| 7.214960449916667 | -0.1 |
| 7.218019791555556 | -0.12 |
| 7.221079411 | -0.13 |
| 7.224139030444444 | -0.12 |
| 7.227204483555556 | -0.11 |
| 7.230273825777777 | -0.12 |
| 7.233335945361111 | -0.11 |
| 7.23639834275 | -0.11 |
| 7.239457962194445 | -0.11 |
| 7.242517303861111 | -0.12 |
| 7.245576923305555 | -0.11 |
| 7.248637376111111 | -0.12 |
| 7.251698940111112 | -0.1 |
| 7.2547596707499995 | -0.12 |
| 7.257820123555555 | -0.12 |
| 7.260879743 | -0.12 |
| 7.263942695972223 | -0.12 |
| 7.267003426583333 | -0.11 |
| 7.270065823972222 | -0.11 |
| 7.273125721222223 | -0.12 |
| 7.276187285222222 | -0.12 |
| 7.279248015833334 | -0.11 |
| 7.282310135416667 | -0.11 |
| 7.28537058825 | -0.09 |
| 7.2884327078333335 | -0.09 |
| 7.291496771972223 | -0.07 |
| 7.294558335972222 | -0.07 |
| 7.297619344388889 | -0.07 |
| 7.300681741777778 | -0.07 |
| 7.3037419168055555 | -0.07 |
| 7.306802369638889 | -0.07 |
| 7.309870322888889 | -0.08 |
| 7.312935498194444 | -0.06 |
| 7.315996784416667 | -0.08 |
| 7.319056959444445 | -0.07 |
| 7.322126023861111 | -0.07 |
| 7.325189254638889 | -0.07 |
| 7.328250263055556 | -0.07 |
| 7.331310715861111 | -0.07 |
| 7.334370057527778 | -0.07 |
| 7.337431343722222 | -0.06 |
| 7.340513186666667 | -0.06 |
| 7.343573917277778 | -0.08 |
| 7.346641037166666 | -0.06 |
| 7.349701767777778 | -0.06 |
| 7.352762220611111 | -0.06 |
| 7.355823784611111 | -0.05 |
| 7.358886459777778 | -0.04 |
| 7.3619483015833325 | -0.07 |
| 7.365009587777777 | -0.06 |
| 7.368071985166667 | -0.06 |
| 7.371131049027778 | -0.07 |
| 7.374206502694444 | -0.04 |
| 7.3772775116944445 | -0.05 |
| 7.380337408916667 | -0.07 |
| 7.383396472777777 | -0.04 |
| 7.386455814444445 | -0.06 |
| 7.389515433888889 | -0.08 |
| 7.392575886694445 | -0.08 |
| 7.395639673055556 | -0.07 |
| 7.398702903833334 | -0.05 |
| 7.401763078861111 | -0.06 |
| 7.404824642861111 | -0.06 |
| 7.407885095666667 | -0.05 |
| 7.410944715111111 | -0.05 |
| 7.414004056777778 | -0.05 |
| 7.417064787388889 | -0.05 |
| 7.420126629194445 | -0.06 |
| 7.423186526416666 | -0.05 |
| 7.426247534833333 | -0.05 |
| 7.429307154277778 | -0.04 |
| 7.432379274444444 | -0.07 |
| 7.435438616083333 | -0.07 |
| 7.438499902305556 | -0.05 |
| 7.441570355694444 | -0.06 |
| 7.444633308666667 | -0.06 |
| 7.447694317083333 | -0.06 |
| 7.450753380944444 | -0.05 |
| 7.453813833750001 | -0.03 |
| 7.456874286583334 | -0.05 |
| 7.459935017194445 | -0.03 |
| 7.462994081055555 | -0.04 |
| 7.4660556450555555 | -0.04 |
| 7.469131376555556 | -0.03 |
| 7.472204607888889 | -0.02 |
| 7.475265060694444 | -0.04 |
| 7.4783255135277775 | -0.04 |
| 7.481389855472222 | -0.05 |
| 7.4844489193333334 | -0.03 |
| 7.487509927722223 | -0.04 |
| 7.490577603194445 | -0.03 |
| 7.493641667333334 | -0.03 |
| 7.496704898111111 | -0.03 |
| 7.499765628722222 | -0.03 |
| 7.502825248166667 | -0.04 |
| 7.505887089972223 | -0.02 |
| 7.508949765138889 | -0.01 |
| 7.512009106777778 | -0.01 |
| 7.515069559611111 | -0.02 |
| 7.518132512583334 | -0.01 |
| 7.521192132027777 | 0 |
| 7.524252307055556 | -0.01 |
| 7.527319149138889 | -0.03 |
| 7.53037987975 | -0.04 |
| 7.533442277138889 | -0.02 |
| 7.536508008055556 | -0.04 |
| 7.539573738944445 | -0.02 |
| 7.542633080611111 | -0.02 |
| 7.545693533416667 | -0.01 |
| 7.548754264055555 | -0.02 |
| 7.551814716861111 | -0.03 |
| 7.554874614111111 | -0.02 |
| 7.557935344722223 | -0.05 |
| 7.560995797555556 | -0.05 |
| 7.564055972583334 | -0.04 |
| 7.56711614761111 | -0.05 |
| 7.570175767055556 | -0.05 |
| 7.573237608861111 | -0.05 |
| 7.576309173416666 | -0.06 |
| 7.57936962625 | -0.06 |
| 7.582428967916667 | -0.02 |
| 7.585488309555556 | -0.04 |
| 7.5885520959166675 | -0.05 |
| 7.591613104305555 | -0.05 |
| 7.5946738349444445 | -0.05 |
| 7.597736510111111 | -0.02 |
| 7.600798074111111 | -0.03 |
| 7.60385824913889 | -0.02 |
| 7.606918701972223 | -0.03 |
| 7.6099783214166665 | -0.05 |
| 7.613041829972222 | -0.04 |
| 7.616102838388889 | -0.03 |
| 7.619170791638888 | -0.04 |
| 7.622230133277777 | -0.03 |
| 7.625290863916667 | -0.02 |
| 7.628353816888889 | -0.03 |
| 7.631413991916667 | -0.03 |
| 7.634474444722223 | -0.04 |
| 7.637546842694444 | -0.06 |
| 7.640610351249999 | -0.05 |
| 7.6436713596666666 | -0.04 |
| 7.646730701305556 | -0.06 |
| 7.649791431916666 | -0.04 |
| 7.652850495777778 | -0.05 |
| 7.655910948611111 | -0.04 |
| 7.658973068194444 | -0.04 |
| 7.662037132333333 | -0.05 |
| 7.66509814075 | -0.04 |
| 7.668157760194444 | -0.04 |
| 7.671217657444444 | -0.05 |
| 7.6742797770277775 | -0.05 |
| 7.677339118666667 | -0.09 |
| 7.680404016194444 | -0.08 |
| 7.683478914305556 | -0.07 |
| 7.686538255944445 | -0.08 |
| 7.689599819944444 | -0.05 |
| 7.692663328499999 | -0.06 |
| 7.695727392638888 | -0.06 |
| 7.69878951225 | -0.05 |
| 7.701849965055556 | -0.06 |
| 7.704910695694444 | -0.07 |
| 7.707971426305556 | -0.08 |
| 7.711031323527778 | -0.07 |
| 7.714091220777778 | -0.06 |
| 7.717150562416667 | -0.06 |
| 7.720210737472223 | -0.06 |
| 7.723273134833334 | -0.07 |
| 7.726333032083333 | -0.07 |
| 7.7293937626944444 | -0.09 |
| 7.732454493305555 | -0.08 |
| 7.735520502027778 | -0.05 |
| 7.738580677055556 | -0.07 |
| 7.741671409388889 | -0.06 |
| 7.744743807333333 | -0.07 |
| 7.747803982361111 | -0.08 |
| 7.7508636018055554 | -0.09 |
| 7.753927110361111 | -0.09 |
| 7.7569870076111105 | -0.11 |
| 7.760046627055556 | -0.13 |
| 7.763107079888889 | -0.11 |
| 7.766166977111111 | -0.12 |
| 7.769230763472222 | -0.12 |
| 7.772293994222222 | -0.12 |
| 7.775357780583334 | -0.12 |
| 7.7784243448611115 | -0.11 |
| 7.781495353861111 | -0.1 |
| 7.784554973305556 | -0.11 |
| 7.787619593027777 | -0.1 |
| 7.7906789346666665 | -0.11 |
| 7.793741887638889 | -0.12 |
| 7.796806785166667 | -0.12 |
| 7.79986890475 | -0.12 |
| 7.802928801999999 | -0.13 |
| 7.805991754972222 | -0.09 |
| 7.809051652194444 | -0.11 |
| 7.812111549444445 | -0.11 |
| 7.815182002833333 | -0.14 |
| 7.818244678027778 | -0.1 |
| 7.821304575249999 | -0.11 |
| 7.8243914184722225 | -0.11 |
| 7.8274543714444444 | -0.09 |
| 7.830515657638889 | -0.06 |
| 7.833579444000001 | -0.07 |
| 7.836639063444444 | -0.07 |
| 7.839702849805556 | -0.06 |
| 7.842765524972222 | -0.05 |
| 7.845826255583334 | -0.04 |
| 7.848893931055556 | -0.05 |
| 7.851955772833334 | -0.04 |
| 7.855015392277777 | -0.04 |
| 7.858076956277778 | -0.05 |
| 7.861143242777778 | -0.03 |
| 7.864202862222222 | -0.03 |
| 7.867262481666667 | -0.03 |
| 7.870324323472222 | -0.04 |
| 7.873383942916667 | -0.03 |
| 7.876443284555556 | -0.02 |
| 7.879503459583334 | -0.03 |
| 7.882564468000001 | -0.05 |
| 7.88562436525 | -0.03 |
| 7.88868592925 | -0.01 |
| 7.891748326638889 | -0.01 |
| 7.894808501666667 | -0.03 |
| 7.897868121111111 | -0.02 |
| 7.90092746275 | -0.03 |
| 7.903987637777778 | -0.04 |
| 7.907047812805556 | -0.03 |
| 7.91010743225 | -0.05 |
| 7.913170940805555 | -0.03 |
| 7.916231115861111 | -0.03 |
| 7.919293513222223 | -0.04 |
| 7.922353688277778 | -0.04 |
| 7.925419141388889 | -0.05 |
| 7.92848153875 | -0.01 |
| 7.931540880416667 | -0.04 |
| 7.934602444416667 | -0.06 |
| 7.937664008416666 | -0.04 |
| 7.940724183444445 | -0.04 |
| 7.9437843584722225 | -0.05 |
| 7.9468445335 | -0.07 |
| 7.949905819722223 | -0.05 |
| 7.952965161361111 | -0.05 |
| 7.9560264475833335 | -0.06 |
| 7.959089956138889 | -0.05 |
| 7.962149297777778 | -0.06 |
| 7.9652164176388895 | -0.04 |
| 7.968277703861111 | -0.05 |
| 7.971338712277778 | -0.05 |
| 7.974427500055556 | -0.05 |
| 7.9774893418333335 | -0.07 |
| 7.980554239361112 | -0.07 |
| 7.983617470138889 | -0.08 |
| 7.986677367361111 | -0.08 |
| 7.989746431805556 | -0.1 |
| 7.992807162416667 | -0.08 |
| 7.995886505222223 | -0.07 |
| 7.998949180388888 | -0.07 |
| 8.002008799833334 | -0.05 |